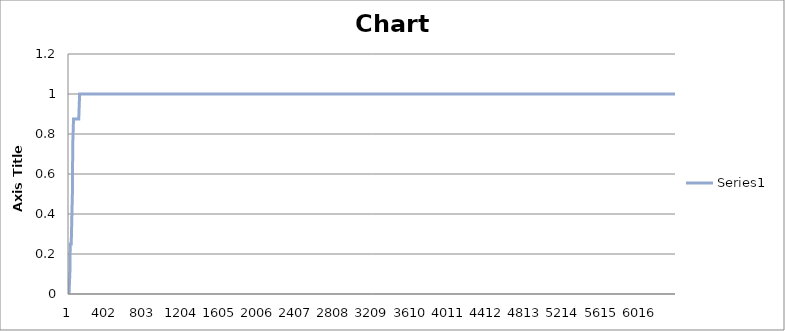
| Category | Series 1 |
|---|---|
| 0 | 0 |
| 1 | 0 |
| 2 | 0 |
| 3 | 0 |
| 4 | 0 |
| 5 | 0 |
| 6 | 0 |
| 7 | 0 |
| 8 | 0 |
| 9 | 0 |
| 10 | 0.125 |
| 11 | 0.125 |
| 12 | 0.25 |
| 13 | 0.25 |
| 14 | 0.25 |
| 15 | 0.25 |
| 16 | 0.25 |
| 17 | 0.25 |
| 18 | 0.25 |
| 19 | 0.25 |
| 20 | 0.25 |
| 21 | 0.25 |
| 22 | 0.25 |
| 23 | 0.25 |
| 24 | 0.25 |
| 25 | 0.25 |
| 26 | 0.25 |
| 27 | 0.25 |
| 28 | 0.25 |
| 29 | 0.375 |
| 30 | 0.375 |
| 31 | 0.375 |
| 32 | 0.375 |
| 33 | 0.375 |
| 34 | 0.375 |
| 35 | 0.5 |
| 36 | 0.5 |
| 37 | 0.625 |
| 38 | 0.625 |
| 39 | 0.75 |
| 40 | 0.75 |
| 41 | 0.75 |
| 42 | 0.75 |
| 43 | 0.75 |
| 44 | 0.75 |
| 45 | 0.75 |
| 46 | 0.75 |
| 47 | 0.875 |
| 48 | 0.875 |
| 49 | 0.875 |
| 50 | 0.875 |
| 51 | 0.875 |
| 52 | 0.875 |
| 53 | 0.875 |
| 54 | 0.875 |
| 55 | 0.875 |
| 56 | 0.875 |
| 57 | 0.875 |
| 58 | 0.875 |
| 59 | 0.875 |
| 60 | 0.875 |
| 61 | 0.875 |
| 62 | 0.875 |
| 63 | 0.875 |
| 64 | 0.875 |
| 65 | 0.875 |
| 66 | 0.875 |
| 67 | 0.875 |
| 68 | 0.875 |
| 69 | 0.875 |
| 70 | 0.875 |
| 71 | 0.875 |
| 72 | 0.875 |
| 73 | 0.875 |
| 74 | 0.875 |
| 75 | 0.875 |
| 76 | 0.875 |
| 77 | 0.875 |
| 78 | 0.875 |
| 79 | 0.875 |
| 80 | 0.875 |
| 81 | 0.875 |
| 82 | 0.875 |
| 83 | 0.875 |
| 84 | 0.875 |
| 85 | 0.875 |
| 86 | 0.875 |
| 87 | 0.875 |
| 88 | 0.875 |
| 89 | 0.875 |
| 90 | 0.875 |
| 91 | 0.875 |
| 92 | 0.875 |
| 93 | 0.875 |
| 94 | 0.875 |
| 95 | 0.875 |
| 96 | 0.875 |
| 97 | 0.875 |
| 98 | 0.875 |
| 99 | 0.875 |
| 100 | 0.875 |
| 101 | 0.875 |
| 102 | 0.875 |
| 103 | 0.875 |
| 104 | 0.875 |
| 105 | 0.875 |
| 106 | 0.875 |
| 107 | 0.875 |
| 108 | 0.875 |
| 109 | 0.875 |
| 110 | 0.875 |
| 111 | 1 |
| 112 | 1 |
| 113 | 1 |
| 114 | 1 |
| 115 | 1 |
| 116 | 1 |
| 117 | 1 |
| 118 | 1 |
| 119 | 1 |
| 120 | 1 |
| 121 | 1 |
| 122 | 1 |
| 123 | 1 |
| 124 | 1 |
| 125 | 1 |
| 126 | 1 |
| 127 | 1 |
| 128 | 1 |
| 129 | 1 |
| 130 | 1 |
| 131 | 1 |
| 132 | 1 |
| 133 | 1 |
| 134 | 1 |
| 135 | 1 |
| 136 | 1 |
| 137 | 1 |
| 138 | 1 |
| 139 | 1 |
| 140 | 1 |
| 141 | 1 |
| 142 | 1 |
| 143 | 1 |
| 144 | 1 |
| 145 | 1 |
| 146 | 1 |
| 147 | 1 |
| 148 | 1 |
| 149 | 1 |
| 150 | 1 |
| 151 | 1 |
| 152 | 1 |
| 153 | 1 |
| 154 | 1 |
| 155 | 1 |
| 156 | 1 |
| 157 | 1 |
| 158 | 1 |
| 159 | 1 |
| 160 | 1 |
| 161 | 1 |
| 162 | 1 |
| 163 | 1 |
| 164 | 1 |
| 165 | 1 |
| 166 | 1 |
| 167 | 1 |
| 168 | 1 |
| 169 | 1 |
| 170 | 1 |
| 171 | 1 |
| 172 | 1 |
| 173 | 1 |
| 174 | 1 |
| 175 | 1 |
| 176 | 1 |
| 177 | 1 |
| 178 | 1 |
| 179 | 1 |
| 180 | 1 |
| 181 | 1 |
| 182 | 1 |
| 183 | 1 |
| 184 | 1 |
| 185 | 1 |
| 186 | 1 |
| 187 | 1 |
| 188 | 1 |
| 189 | 1 |
| 190 | 1 |
| 191 | 1 |
| 192 | 1 |
| 193 | 1 |
| 194 | 1 |
| 195 | 1 |
| 196 | 1 |
| 197 | 1 |
| 198 | 1 |
| 199 | 1 |
| 200 | 1 |
| 201 | 1 |
| 202 | 1 |
| 203 | 1 |
| 204 | 1 |
| 205 | 1 |
| 206 | 1 |
| 207 | 1 |
| 208 | 1 |
| 209 | 1 |
| 210 | 1 |
| 211 | 1 |
| 212 | 1 |
| 213 | 1 |
| 214 | 1 |
| 215 | 1 |
| 216 | 1 |
| 217 | 1 |
| 218 | 1 |
| 219 | 1 |
| 220 | 1 |
| 221 | 1 |
| 222 | 1 |
| 223 | 1 |
| 224 | 1 |
| 225 | 1 |
| 226 | 1 |
| 227 | 1 |
| 228 | 1 |
| 229 | 1 |
| 230 | 1 |
| 231 | 1 |
| 232 | 1 |
| 233 | 1 |
| 234 | 1 |
| 235 | 1 |
| 236 | 1 |
| 237 | 1 |
| 238 | 1 |
| 239 | 1 |
| 240 | 1 |
| 241 | 1 |
| 242 | 1 |
| 243 | 1 |
| 244 | 1 |
| 245 | 1 |
| 246 | 1 |
| 247 | 1 |
| 248 | 1 |
| 249 | 1 |
| 250 | 1 |
| 251 | 1 |
| 252 | 1 |
| 253 | 1 |
| 254 | 1 |
| 255 | 1 |
| 256 | 1 |
| 257 | 1 |
| 258 | 1 |
| 259 | 1 |
| 260 | 1 |
| 261 | 1 |
| 262 | 1 |
| 263 | 1 |
| 264 | 1 |
| 265 | 1 |
| 266 | 1 |
| 267 | 1 |
| 268 | 1 |
| 269 | 1 |
| 270 | 1 |
| 271 | 1 |
| 272 | 1 |
| 273 | 1 |
| 274 | 1 |
| 275 | 1 |
| 276 | 1 |
| 277 | 1 |
| 278 | 1 |
| 279 | 1 |
| 280 | 1 |
| 281 | 1 |
| 282 | 1 |
| 283 | 1 |
| 284 | 1 |
| 285 | 1 |
| 286 | 1 |
| 287 | 1 |
| 288 | 1 |
| 289 | 1 |
| 290 | 1 |
| 291 | 1 |
| 292 | 1 |
| 293 | 1 |
| 294 | 1 |
| 295 | 1 |
| 296 | 1 |
| 297 | 1 |
| 298 | 1 |
| 299 | 1 |
| 300 | 1 |
| 301 | 1 |
| 302 | 1 |
| 303 | 1 |
| 304 | 1 |
| 305 | 1 |
| 306 | 1 |
| 307 | 1 |
| 308 | 1 |
| 309 | 1 |
| 310 | 1 |
| 311 | 1 |
| 312 | 1 |
| 313 | 1 |
| 314 | 1 |
| 315 | 1 |
| 316 | 1 |
| 317 | 1 |
| 318 | 1 |
| 319 | 1 |
| 320 | 1 |
| 321 | 1 |
| 322 | 1 |
| 323 | 1 |
| 324 | 1 |
| 325 | 1 |
| 326 | 1 |
| 327 | 1 |
| 328 | 1 |
| 329 | 1 |
| 330 | 1 |
| 331 | 1 |
| 332 | 1 |
| 333 | 1 |
| 334 | 1 |
| 335 | 1 |
| 336 | 1 |
| 337 | 1 |
| 338 | 1 |
| 339 | 1 |
| 340 | 1 |
| 341 | 1 |
| 342 | 1 |
| 343 | 1 |
| 344 | 1 |
| 345 | 1 |
| 346 | 1 |
| 347 | 1 |
| 348 | 1 |
| 349 | 1 |
| 350 | 1 |
| 351 | 1 |
| 352 | 1 |
| 353 | 1 |
| 354 | 1 |
| 355 | 1 |
| 356 | 1 |
| 357 | 1 |
| 358 | 1 |
| 359 | 1 |
| 360 | 1 |
| 361 | 1 |
| 362 | 1 |
| 363 | 1 |
| 364 | 1 |
| 365 | 1 |
| 366 | 1 |
| 367 | 1 |
| 368 | 1 |
| 369 | 1 |
| 370 | 1 |
| 371 | 1 |
| 372 | 1 |
| 373 | 1 |
| 374 | 1 |
| 375 | 1 |
| 376 | 1 |
| 377 | 1 |
| 378 | 1 |
| 379 | 1 |
| 380 | 1 |
| 381 | 1 |
| 382 | 1 |
| 383 | 1 |
| 384 | 1 |
| 385 | 1 |
| 386 | 1 |
| 387 | 1 |
| 388 | 1 |
| 389 | 1 |
| 390 | 1 |
| 391 | 1 |
| 392 | 1 |
| 393 | 1 |
| 394 | 1 |
| 395 | 1 |
| 396 | 1 |
| 397 | 1 |
| 398 | 1 |
| 399 | 1 |
| 400 | 1 |
| 401 | 1 |
| 402 | 1 |
| 403 | 1 |
| 404 | 1 |
| 405 | 1 |
| 406 | 1 |
| 407 | 1 |
| 408 | 1 |
| 409 | 1 |
| 410 | 1 |
| 411 | 1 |
| 412 | 1 |
| 413 | 1 |
| 414 | 1 |
| 415 | 1 |
| 416 | 1 |
| 417 | 1 |
| 418 | 1 |
| 419 | 1 |
| 420 | 1 |
| 421 | 1 |
| 422 | 1 |
| 423 | 1 |
| 424 | 1 |
| 425 | 1 |
| 426 | 1 |
| 427 | 1 |
| 428 | 1 |
| 429 | 1 |
| 430 | 1 |
| 431 | 1 |
| 432 | 1 |
| 433 | 1 |
| 434 | 1 |
| 435 | 1 |
| 436 | 1 |
| 437 | 1 |
| 438 | 1 |
| 439 | 1 |
| 440 | 1 |
| 441 | 1 |
| 442 | 1 |
| 443 | 1 |
| 444 | 1 |
| 445 | 1 |
| 446 | 1 |
| 447 | 1 |
| 448 | 1 |
| 449 | 1 |
| 450 | 1 |
| 451 | 1 |
| 452 | 1 |
| 453 | 1 |
| 454 | 1 |
| 455 | 1 |
| 456 | 1 |
| 457 | 1 |
| 458 | 1 |
| 459 | 1 |
| 460 | 1 |
| 461 | 1 |
| 462 | 1 |
| 463 | 1 |
| 464 | 1 |
| 465 | 1 |
| 466 | 1 |
| 467 | 1 |
| 468 | 1 |
| 469 | 1 |
| 470 | 1 |
| 471 | 1 |
| 472 | 1 |
| 473 | 1 |
| 474 | 1 |
| 475 | 1 |
| 476 | 1 |
| 477 | 1 |
| 478 | 1 |
| 479 | 1 |
| 480 | 1 |
| 481 | 1 |
| 482 | 1 |
| 483 | 1 |
| 484 | 1 |
| 485 | 1 |
| 486 | 1 |
| 487 | 1 |
| 488 | 1 |
| 489 | 1 |
| 490 | 1 |
| 491 | 1 |
| 492 | 1 |
| 493 | 1 |
| 494 | 1 |
| 495 | 1 |
| 496 | 1 |
| 497 | 1 |
| 498 | 1 |
| 499 | 1 |
| 500 | 1 |
| 501 | 1 |
| 502 | 1 |
| 503 | 1 |
| 504 | 1 |
| 505 | 1 |
| 506 | 1 |
| 507 | 1 |
| 508 | 1 |
| 509 | 1 |
| 510 | 1 |
| 511 | 1 |
| 512 | 1 |
| 513 | 1 |
| 514 | 1 |
| 515 | 1 |
| 516 | 1 |
| 517 | 1 |
| 518 | 1 |
| 519 | 1 |
| 520 | 1 |
| 521 | 1 |
| 522 | 1 |
| 523 | 1 |
| 524 | 1 |
| 525 | 1 |
| 526 | 1 |
| 527 | 1 |
| 528 | 1 |
| 529 | 1 |
| 530 | 1 |
| 531 | 1 |
| 532 | 1 |
| 533 | 1 |
| 534 | 1 |
| 535 | 1 |
| 536 | 1 |
| 537 | 1 |
| 538 | 1 |
| 539 | 1 |
| 540 | 1 |
| 541 | 1 |
| 542 | 1 |
| 543 | 1 |
| 544 | 1 |
| 545 | 1 |
| 546 | 1 |
| 547 | 1 |
| 548 | 1 |
| 549 | 1 |
| 550 | 1 |
| 551 | 1 |
| 552 | 1 |
| 553 | 1 |
| 554 | 1 |
| 555 | 1 |
| 556 | 1 |
| 557 | 1 |
| 558 | 1 |
| 559 | 1 |
| 560 | 1 |
| 561 | 1 |
| 562 | 1 |
| 563 | 1 |
| 564 | 1 |
| 565 | 1 |
| 566 | 1 |
| 567 | 1 |
| 568 | 1 |
| 569 | 1 |
| 570 | 1 |
| 571 | 1 |
| 572 | 1 |
| 573 | 1 |
| 574 | 1 |
| 575 | 1 |
| 576 | 1 |
| 577 | 1 |
| 578 | 1 |
| 579 | 1 |
| 580 | 1 |
| 581 | 1 |
| 582 | 1 |
| 583 | 1 |
| 584 | 1 |
| 585 | 1 |
| 586 | 1 |
| 587 | 1 |
| 588 | 1 |
| 589 | 1 |
| 590 | 1 |
| 591 | 1 |
| 592 | 1 |
| 593 | 1 |
| 594 | 1 |
| 595 | 1 |
| 596 | 1 |
| 597 | 1 |
| 598 | 1 |
| 599 | 1 |
| 600 | 1 |
| 601 | 1 |
| 602 | 1 |
| 603 | 1 |
| 604 | 1 |
| 605 | 1 |
| 606 | 1 |
| 607 | 1 |
| 608 | 1 |
| 609 | 1 |
| 610 | 1 |
| 611 | 1 |
| 612 | 1 |
| 613 | 1 |
| 614 | 1 |
| 615 | 1 |
| 616 | 1 |
| 617 | 1 |
| 618 | 1 |
| 619 | 1 |
| 620 | 1 |
| 621 | 1 |
| 622 | 1 |
| 623 | 1 |
| 624 | 1 |
| 625 | 1 |
| 626 | 1 |
| 627 | 1 |
| 628 | 1 |
| 629 | 1 |
| 630 | 1 |
| 631 | 1 |
| 632 | 1 |
| 633 | 1 |
| 634 | 1 |
| 635 | 1 |
| 636 | 1 |
| 637 | 1 |
| 638 | 1 |
| 639 | 1 |
| 640 | 1 |
| 641 | 1 |
| 642 | 1 |
| 643 | 1 |
| 644 | 1 |
| 645 | 1 |
| 646 | 1 |
| 647 | 1 |
| 648 | 1 |
| 649 | 1 |
| 650 | 1 |
| 651 | 1 |
| 652 | 1 |
| 653 | 1 |
| 654 | 1 |
| 655 | 1 |
| 656 | 1 |
| 657 | 1 |
| 658 | 1 |
| 659 | 1 |
| 660 | 1 |
| 661 | 1 |
| 662 | 1 |
| 663 | 1 |
| 664 | 1 |
| 665 | 1 |
| 666 | 1 |
| 667 | 1 |
| 668 | 1 |
| 669 | 1 |
| 670 | 1 |
| 671 | 1 |
| 672 | 1 |
| 673 | 1 |
| 674 | 1 |
| 675 | 1 |
| 676 | 1 |
| 677 | 1 |
| 678 | 1 |
| 679 | 1 |
| 680 | 1 |
| 681 | 1 |
| 682 | 1 |
| 683 | 1 |
| 684 | 1 |
| 685 | 1 |
| 686 | 1 |
| 687 | 1 |
| 688 | 1 |
| 689 | 1 |
| 690 | 1 |
| 691 | 1 |
| 692 | 1 |
| 693 | 1 |
| 694 | 1 |
| 695 | 1 |
| 696 | 1 |
| 697 | 1 |
| 698 | 1 |
| 699 | 1 |
| 700 | 1 |
| 701 | 1 |
| 702 | 1 |
| 703 | 1 |
| 704 | 1 |
| 705 | 1 |
| 706 | 1 |
| 707 | 1 |
| 708 | 1 |
| 709 | 1 |
| 710 | 1 |
| 711 | 1 |
| 712 | 1 |
| 713 | 1 |
| 714 | 1 |
| 715 | 1 |
| 716 | 1 |
| 717 | 1 |
| 718 | 1 |
| 719 | 1 |
| 720 | 1 |
| 721 | 1 |
| 722 | 1 |
| 723 | 1 |
| 724 | 1 |
| 725 | 1 |
| 726 | 1 |
| 727 | 1 |
| 728 | 1 |
| 729 | 1 |
| 730 | 1 |
| 731 | 1 |
| 732 | 1 |
| 733 | 1 |
| 734 | 1 |
| 735 | 1 |
| 736 | 1 |
| 737 | 1 |
| 738 | 1 |
| 739 | 1 |
| 740 | 1 |
| 741 | 1 |
| 742 | 1 |
| 743 | 1 |
| 744 | 1 |
| 745 | 1 |
| 746 | 1 |
| 747 | 1 |
| 748 | 1 |
| 749 | 1 |
| 750 | 1 |
| 751 | 1 |
| 752 | 1 |
| 753 | 1 |
| 754 | 1 |
| 755 | 1 |
| 756 | 1 |
| 757 | 1 |
| 758 | 1 |
| 759 | 1 |
| 760 | 1 |
| 761 | 1 |
| 762 | 1 |
| 763 | 1 |
| 764 | 1 |
| 765 | 1 |
| 766 | 1 |
| 767 | 1 |
| 768 | 1 |
| 769 | 1 |
| 770 | 1 |
| 771 | 1 |
| 772 | 1 |
| 773 | 1 |
| 774 | 1 |
| 775 | 1 |
| 776 | 1 |
| 777 | 1 |
| 778 | 1 |
| 779 | 1 |
| 780 | 1 |
| 781 | 1 |
| 782 | 1 |
| 783 | 1 |
| 784 | 1 |
| 785 | 1 |
| 786 | 1 |
| 787 | 1 |
| 788 | 1 |
| 789 | 1 |
| 790 | 1 |
| 791 | 1 |
| 792 | 1 |
| 793 | 1 |
| 794 | 1 |
| 795 | 1 |
| 796 | 1 |
| 797 | 1 |
| 798 | 1 |
| 799 | 1 |
| 800 | 1 |
| 801 | 1 |
| 802 | 1 |
| 803 | 1 |
| 804 | 1 |
| 805 | 1 |
| 806 | 1 |
| 807 | 1 |
| 808 | 1 |
| 809 | 1 |
| 810 | 1 |
| 811 | 1 |
| 812 | 1 |
| 813 | 1 |
| 814 | 1 |
| 815 | 1 |
| 816 | 1 |
| 817 | 1 |
| 818 | 1 |
| 819 | 1 |
| 820 | 1 |
| 821 | 1 |
| 822 | 1 |
| 823 | 1 |
| 824 | 1 |
| 825 | 1 |
| 826 | 1 |
| 827 | 1 |
| 828 | 1 |
| 829 | 1 |
| 830 | 1 |
| 831 | 1 |
| 832 | 1 |
| 833 | 1 |
| 834 | 1 |
| 835 | 1 |
| 836 | 1 |
| 837 | 1 |
| 838 | 1 |
| 839 | 1 |
| 840 | 1 |
| 841 | 1 |
| 842 | 1 |
| 843 | 1 |
| 844 | 1 |
| 845 | 1 |
| 846 | 1 |
| 847 | 1 |
| 848 | 1 |
| 849 | 1 |
| 850 | 1 |
| 851 | 1 |
| 852 | 1 |
| 853 | 1 |
| 854 | 1 |
| 855 | 1 |
| 856 | 1 |
| 857 | 1 |
| 858 | 1 |
| 859 | 1 |
| 860 | 1 |
| 861 | 1 |
| 862 | 1 |
| 863 | 1 |
| 864 | 1 |
| 865 | 1 |
| 866 | 1 |
| 867 | 1 |
| 868 | 1 |
| 869 | 1 |
| 870 | 1 |
| 871 | 1 |
| 872 | 1 |
| 873 | 1 |
| 874 | 1 |
| 875 | 1 |
| 876 | 1 |
| 877 | 1 |
| 878 | 1 |
| 879 | 1 |
| 880 | 1 |
| 881 | 1 |
| 882 | 1 |
| 883 | 1 |
| 884 | 1 |
| 885 | 1 |
| 886 | 1 |
| 887 | 1 |
| 888 | 1 |
| 889 | 1 |
| 890 | 1 |
| 891 | 1 |
| 892 | 1 |
| 893 | 1 |
| 894 | 1 |
| 895 | 1 |
| 896 | 1 |
| 897 | 1 |
| 898 | 1 |
| 899 | 1 |
| 900 | 1 |
| 901 | 1 |
| 902 | 1 |
| 903 | 1 |
| 904 | 1 |
| 905 | 1 |
| 906 | 1 |
| 907 | 1 |
| 908 | 1 |
| 909 | 1 |
| 910 | 1 |
| 911 | 1 |
| 912 | 1 |
| 913 | 1 |
| 914 | 1 |
| 915 | 1 |
| 916 | 1 |
| 917 | 1 |
| 918 | 1 |
| 919 | 1 |
| 920 | 1 |
| 921 | 1 |
| 922 | 1 |
| 923 | 1 |
| 924 | 1 |
| 925 | 1 |
| 926 | 1 |
| 927 | 1 |
| 928 | 1 |
| 929 | 1 |
| 930 | 1 |
| 931 | 1 |
| 932 | 1 |
| 933 | 1 |
| 934 | 1 |
| 935 | 1 |
| 936 | 1 |
| 937 | 1 |
| 938 | 1 |
| 939 | 1 |
| 940 | 1 |
| 941 | 1 |
| 942 | 1 |
| 943 | 1 |
| 944 | 1 |
| 945 | 1 |
| 946 | 1 |
| 947 | 1 |
| 948 | 1 |
| 949 | 1 |
| 950 | 1 |
| 951 | 1 |
| 952 | 1 |
| 953 | 1 |
| 954 | 1 |
| 955 | 1 |
| 956 | 1 |
| 957 | 1 |
| 958 | 1 |
| 959 | 1 |
| 960 | 1 |
| 961 | 1 |
| 962 | 1 |
| 963 | 1 |
| 964 | 1 |
| 965 | 1 |
| 966 | 1 |
| 967 | 1 |
| 968 | 1 |
| 969 | 1 |
| 970 | 1 |
| 971 | 1 |
| 972 | 1 |
| 973 | 1 |
| 974 | 1 |
| 975 | 1 |
| 976 | 1 |
| 977 | 1 |
| 978 | 1 |
| 979 | 1 |
| 980 | 1 |
| 981 | 1 |
| 982 | 1 |
| 983 | 1 |
| 984 | 1 |
| 985 | 1 |
| 986 | 1 |
| 987 | 1 |
| 988 | 1 |
| 989 | 1 |
| 990 | 1 |
| 991 | 1 |
| 992 | 1 |
| 993 | 1 |
| 994 | 1 |
| 995 | 1 |
| 996 | 1 |
| 997 | 1 |
| 998 | 1 |
| 999 | 1 |
| 1000 | 1 |
| 1001 | 1 |
| 1002 | 1 |
| 1003 | 1 |
| 1004 | 1 |
| 1005 | 1 |
| 1006 | 1 |
| 1007 | 1 |
| 1008 | 1 |
| 1009 | 1 |
| 1010 | 1 |
| 1011 | 1 |
| 1012 | 1 |
| 1013 | 1 |
| 1014 | 1 |
| 1015 | 1 |
| 1016 | 1 |
| 1017 | 1 |
| 1018 | 1 |
| 1019 | 1 |
| 1020 | 1 |
| 1021 | 1 |
| 1022 | 1 |
| 1023 | 1 |
| 1024 | 1 |
| 1025 | 1 |
| 1026 | 1 |
| 1027 | 1 |
| 1028 | 1 |
| 1029 | 1 |
| 1030 | 1 |
| 1031 | 1 |
| 1032 | 1 |
| 1033 | 1 |
| 1034 | 1 |
| 1035 | 1 |
| 1036 | 1 |
| 1037 | 1 |
| 1038 | 1 |
| 1039 | 1 |
| 1040 | 1 |
| 1041 | 1 |
| 1042 | 1 |
| 1043 | 1 |
| 1044 | 1 |
| 1045 | 1 |
| 1046 | 1 |
| 1047 | 1 |
| 1048 | 1 |
| 1049 | 1 |
| 1050 | 1 |
| 1051 | 1 |
| 1052 | 1 |
| 1053 | 1 |
| 1054 | 1 |
| 1055 | 1 |
| 1056 | 1 |
| 1057 | 1 |
| 1058 | 1 |
| 1059 | 1 |
| 1060 | 1 |
| 1061 | 1 |
| 1062 | 1 |
| 1063 | 1 |
| 1064 | 1 |
| 1065 | 1 |
| 1066 | 1 |
| 1067 | 1 |
| 1068 | 1 |
| 1069 | 1 |
| 1070 | 1 |
| 1071 | 1 |
| 1072 | 1 |
| 1073 | 1 |
| 1074 | 1 |
| 1075 | 1 |
| 1076 | 1 |
| 1077 | 1 |
| 1078 | 1 |
| 1079 | 1 |
| 1080 | 1 |
| 1081 | 1 |
| 1082 | 1 |
| 1083 | 1 |
| 1084 | 1 |
| 1085 | 1 |
| 1086 | 1 |
| 1087 | 1 |
| 1088 | 1 |
| 1089 | 1 |
| 1090 | 1 |
| 1091 | 1 |
| 1092 | 1 |
| 1093 | 1 |
| 1094 | 1 |
| 1095 | 1 |
| 1096 | 1 |
| 1097 | 1 |
| 1098 | 1 |
| 1099 | 1 |
| 1100 | 1 |
| 1101 | 1 |
| 1102 | 1 |
| 1103 | 1 |
| 1104 | 1 |
| 1105 | 1 |
| 1106 | 1 |
| 1107 | 1 |
| 1108 | 1 |
| 1109 | 1 |
| 1110 | 1 |
| 1111 | 1 |
| 1112 | 1 |
| 1113 | 1 |
| 1114 | 1 |
| 1115 | 1 |
| 1116 | 1 |
| 1117 | 1 |
| 1118 | 1 |
| 1119 | 1 |
| 1120 | 1 |
| 1121 | 1 |
| 1122 | 1 |
| 1123 | 1 |
| 1124 | 1 |
| 1125 | 1 |
| 1126 | 1 |
| 1127 | 1 |
| 1128 | 1 |
| 1129 | 1 |
| 1130 | 1 |
| 1131 | 1 |
| 1132 | 1 |
| 1133 | 1 |
| 1134 | 1 |
| 1135 | 1 |
| 1136 | 1 |
| 1137 | 1 |
| 1138 | 1 |
| 1139 | 1 |
| 1140 | 1 |
| 1141 | 1 |
| 1142 | 1 |
| 1143 | 1 |
| 1144 | 1 |
| 1145 | 1 |
| 1146 | 1 |
| 1147 | 1 |
| 1148 | 1 |
| 1149 | 1 |
| 1150 | 1 |
| 1151 | 1 |
| 1152 | 1 |
| 1153 | 1 |
| 1154 | 1 |
| 1155 | 1 |
| 1156 | 1 |
| 1157 | 1 |
| 1158 | 1 |
| 1159 | 1 |
| 1160 | 1 |
| 1161 | 1 |
| 1162 | 1 |
| 1163 | 1 |
| 1164 | 1 |
| 1165 | 1 |
| 1166 | 1 |
| 1167 | 1 |
| 1168 | 1 |
| 1169 | 1 |
| 1170 | 1 |
| 1171 | 1 |
| 1172 | 1 |
| 1173 | 1 |
| 1174 | 1 |
| 1175 | 1 |
| 1176 | 1 |
| 1177 | 1 |
| 1178 | 1 |
| 1179 | 1 |
| 1180 | 1 |
| 1181 | 1 |
| 1182 | 1 |
| 1183 | 1 |
| 1184 | 1 |
| 1185 | 1 |
| 1186 | 1 |
| 1187 | 1 |
| 1188 | 1 |
| 1189 | 1 |
| 1190 | 1 |
| 1191 | 1 |
| 1192 | 1 |
| 1193 | 1 |
| 1194 | 1 |
| 1195 | 1 |
| 1196 | 1 |
| 1197 | 1 |
| 1198 | 1 |
| 1199 | 1 |
| 1200 | 1 |
| 1201 | 1 |
| 1202 | 1 |
| 1203 | 1 |
| 1204 | 1 |
| 1205 | 1 |
| 1206 | 1 |
| 1207 | 1 |
| 1208 | 1 |
| 1209 | 1 |
| 1210 | 1 |
| 1211 | 1 |
| 1212 | 1 |
| 1213 | 1 |
| 1214 | 1 |
| 1215 | 1 |
| 1216 | 1 |
| 1217 | 1 |
| 1218 | 1 |
| 1219 | 1 |
| 1220 | 1 |
| 1221 | 1 |
| 1222 | 1 |
| 1223 | 1 |
| 1224 | 1 |
| 1225 | 1 |
| 1226 | 1 |
| 1227 | 1 |
| 1228 | 1 |
| 1229 | 1 |
| 1230 | 1 |
| 1231 | 1 |
| 1232 | 1 |
| 1233 | 1 |
| 1234 | 1 |
| 1235 | 1 |
| 1236 | 1 |
| 1237 | 1 |
| 1238 | 1 |
| 1239 | 1 |
| 1240 | 1 |
| 1241 | 1 |
| 1242 | 1 |
| 1243 | 1 |
| 1244 | 1 |
| 1245 | 1 |
| 1246 | 1 |
| 1247 | 1 |
| 1248 | 1 |
| 1249 | 1 |
| 1250 | 1 |
| 1251 | 1 |
| 1252 | 1 |
| 1253 | 1 |
| 1254 | 1 |
| 1255 | 1 |
| 1256 | 1 |
| 1257 | 1 |
| 1258 | 1 |
| 1259 | 1 |
| 1260 | 1 |
| 1261 | 1 |
| 1262 | 1 |
| 1263 | 1 |
| 1264 | 1 |
| 1265 | 1 |
| 1266 | 1 |
| 1267 | 1 |
| 1268 | 1 |
| 1269 | 1 |
| 1270 | 1 |
| 1271 | 1 |
| 1272 | 1 |
| 1273 | 1 |
| 1274 | 1 |
| 1275 | 1 |
| 1276 | 1 |
| 1277 | 1 |
| 1278 | 1 |
| 1279 | 1 |
| 1280 | 1 |
| 1281 | 1 |
| 1282 | 1 |
| 1283 | 1 |
| 1284 | 1 |
| 1285 | 1 |
| 1286 | 1 |
| 1287 | 1 |
| 1288 | 1 |
| 1289 | 1 |
| 1290 | 1 |
| 1291 | 1 |
| 1292 | 1 |
| 1293 | 1 |
| 1294 | 1 |
| 1295 | 1 |
| 1296 | 1 |
| 1297 | 1 |
| 1298 | 1 |
| 1299 | 1 |
| 1300 | 1 |
| 1301 | 1 |
| 1302 | 1 |
| 1303 | 1 |
| 1304 | 1 |
| 1305 | 1 |
| 1306 | 1 |
| 1307 | 1 |
| 1308 | 1 |
| 1309 | 1 |
| 1310 | 1 |
| 1311 | 1 |
| 1312 | 1 |
| 1313 | 1 |
| 1314 | 1 |
| 1315 | 1 |
| 1316 | 1 |
| 1317 | 1 |
| 1318 | 1 |
| 1319 | 1 |
| 1320 | 1 |
| 1321 | 1 |
| 1322 | 1 |
| 1323 | 1 |
| 1324 | 1 |
| 1325 | 1 |
| 1326 | 1 |
| 1327 | 1 |
| 1328 | 1 |
| 1329 | 1 |
| 1330 | 1 |
| 1331 | 1 |
| 1332 | 1 |
| 1333 | 1 |
| 1334 | 1 |
| 1335 | 1 |
| 1336 | 1 |
| 1337 | 1 |
| 1338 | 1 |
| 1339 | 1 |
| 1340 | 1 |
| 1341 | 1 |
| 1342 | 1 |
| 1343 | 1 |
| 1344 | 1 |
| 1345 | 1 |
| 1346 | 1 |
| 1347 | 1 |
| 1348 | 1 |
| 1349 | 1 |
| 1350 | 1 |
| 1351 | 1 |
| 1352 | 1 |
| 1353 | 1 |
| 1354 | 1 |
| 1355 | 1 |
| 1356 | 1 |
| 1357 | 1 |
| 1358 | 1 |
| 1359 | 1 |
| 1360 | 1 |
| 1361 | 1 |
| 1362 | 1 |
| 1363 | 1 |
| 1364 | 1 |
| 1365 | 1 |
| 1366 | 1 |
| 1367 | 1 |
| 1368 | 1 |
| 1369 | 1 |
| 1370 | 1 |
| 1371 | 1 |
| 1372 | 1 |
| 1373 | 1 |
| 1374 | 1 |
| 1375 | 1 |
| 1376 | 1 |
| 1377 | 1 |
| 1378 | 1 |
| 1379 | 1 |
| 1380 | 1 |
| 1381 | 1 |
| 1382 | 1 |
| 1383 | 1 |
| 1384 | 1 |
| 1385 | 1 |
| 1386 | 1 |
| 1387 | 1 |
| 1388 | 1 |
| 1389 | 1 |
| 1390 | 1 |
| 1391 | 1 |
| 1392 | 1 |
| 1393 | 1 |
| 1394 | 1 |
| 1395 | 1 |
| 1396 | 1 |
| 1397 | 1 |
| 1398 | 1 |
| 1399 | 1 |
| 1400 | 1 |
| 1401 | 1 |
| 1402 | 1 |
| 1403 | 1 |
| 1404 | 1 |
| 1405 | 1 |
| 1406 | 1 |
| 1407 | 1 |
| 1408 | 1 |
| 1409 | 1 |
| 1410 | 1 |
| 1411 | 1 |
| 1412 | 1 |
| 1413 | 1 |
| 1414 | 1 |
| 1415 | 1 |
| 1416 | 1 |
| 1417 | 1 |
| 1418 | 1 |
| 1419 | 1 |
| 1420 | 1 |
| 1421 | 1 |
| 1422 | 1 |
| 1423 | 1 |
| 1424 | 1 |
| 1425 | 1 |
| 1426 | 1 |
| 1427 | 1 |
| 1428 | 1 |
| 1429 | 1 |
| 1430 | 1 |
| 1431 | 1 |
| 1432 | 1 |
| 1433 | 1 |
| 1434 | 1 |
| 1435 | 1 |
| 1436 | 1 |
| 1437 | 1 |
| 1438 | 1 |
| 1439 | 1 |
| 1440 | 1 |
| 1441 | 1 |
| 1442 | 1 |
| 1443 | 1 |
| 1444 | 1 |
| 1445 | 1 |
| 1446 | 1 |
| 1447 | 1 |
| 1448 | 1 |
| 1449 | 1 |
| 1450 | 1 |
| 1451 | 1 |
| 1452 | 1 |
| 1453 | 1 |
| 1454 | 1 |
| 1455 | 1 |
| 1456 | 1 |
| 1457 | 1 |
| 1458 | 1 |
| 1459 | 1 |
| 1460 | 1 |
| 1461 | 1 |
| 1462 | 1 |
| 1463 | 1 |
| 1464 | 1 |
| 1465 | 1 |
| 1466 | 1 |
| 1467 | 1 |
| 1468 | 1 |
| 1469 | 1 |
| 1470 | 1 |
| 1471 | 1 |
| 1472 | 1 |
| 1473 | 1 |
| 1474 | 1 |
| 1475 | 1 |
| 1476 | 1 |
| 1477 | 1 |
| 1478 | 1 |
| 1479 | 1 |
| 1480 | 1 |
| 1481 | 1 |
| 1482 | 1 |
| 1483 | 1 |
| 1484 | 1 |
| 1485 | 1 |
| 1486 | 1 |
| 1487 | 1 |
| 1488 | 1 |
| 1489 | 1 |
| 1490 | 1 |
| 1491 | 1 |
| 1492 | 1 |
| 1493 | 1 |
| 1494 | 1 |
| 1495 | 1 |
| 1496 | 1 |
| 1497 | 1 |
| 1498 | 1 |
| 1499 | 1 |
| 1500 | 1 |
| 1501 | 1 |
| 1502 | 1 |
| 1503 | 1 |
| 1504 | 1 |
| 1505 | 1 |
| 1506 | 1 |
| 1507 | 1 |
| 1508 | 1 |
| 1509 | 1 |
| 1510 | 1 |
| 1511 | 1 |
| 1512 | 1 |
| 1513 | 1 |
| 1514 | 1 |
| 1515 | 1 |
| 1516 | 1 |
| 1517 | 1 |
| 1518 | 1 |
| 1519 | 1 |
| 1520 | 1 |
| 1521 | 1 |
| 1522 | 1 |
| 1523 | 1 |
| 1524 | 1 |
| 1525 | 1 |
| 1526 | 1 |
| 1527 | 1 |
| 1528 | 1 |
| 1529 | 1 |
| 1530 | 1 |
| 1531 | 1 |
| 1532 | 1 |
| 1533 | 1 |
| 1534 | 1 |
| 1535 | 1 |
| 1536 | 1 |
| 1537 | 1 |
| 1538 | 1 |
| 1539 | 1 |
| 1540 | 1 |
| 1541 | 1 |
| 1542 | 1 |
| 1543 | 1 |
| 1544 | 1 |
| 1545 | 1 |
| 1546 | 1 |
| 1547 | 1 |
| 1548 | 1 |
| 1549 | 1 |
| 1550 | 1 |
| 1551 | 1 |
| 1552 | 1 |
| 1553 | 1 |
| 1554 | 1 |
| 1555 | 1 |
| 1556 | 1 |
| 1557 | 1 |
| 1558 | 1 |
| 1559 | 1 |
| 1560 | 1 |
| 1561 | 1 |
| 1562 | 1 |
| 1563 | 1 |
| 1564 | 1 |
| 1565 | 1 |
| 1566 | 1 |
| 1567 | 1 |
| 1568 | 1 |
| 1569 | 1 |
| 1570 | 1 |
| 1571 | 1 |
| 1572 | 1 |
| 1573 | 1 |
| 1574 | 1 |
| 1575 | 1 |
| 1576 | 1 |
| 1577 | 1 |
| 1578 | 1 |
| 1579 | 1 |
| 1580 | 1 |
| 1581 | 1 |
| 1582 | 1 |
| 1583 | 1 |
| 1584 | 1 |
| 1585 | 1 |
| 1586 | 1 |
| 1587 | 1 |
| 1588 | 1 |
| 1589 | 1 |
| 1590 | 1 |
| 1591 | 1 |
| 1592 | 1 |
| 1593 | 1 |
| 1594 | 1 |
| 1595 | 1 |
| 1596 | 1 |
| 1597 | 1 |
| 1598 | 1 |
| 1599 | 1 |
| 1600 | 1 |
| 1601 | 1 |
| 1602 | 1 |
| 1603 | 1 |
| 1604 | 1 |
| 1605 | 1 |
| 1606 | 1 |
| 1607 | 1 |
| 1608 | 1 |
| 1609 | 1 |
| 1610 | 1 |
| 1611 | 1 |
| 1612 | 1 |
| 1613 | 1 |
| 1614 | 1 |
| 1615 | 1 |
| 1616 | 1 |
| 1617 | 1 |
| 1618 | 1 |
| 1619 | 1 |
| 1620 | 1 |
| 1621 | 1 |
| 1622 | 1 |
| 1623 | 1 |
| 1624 | 1 |
| 1625 | 1 |
| 1626 | 1 |
| 1627 | 1 |
| 1628 | 1 |
| 1629 | 1 |
| 1630 | 1 |
| 1631 | 1 |
| 1632 | 1 |
| 1633 | 1 |
| 1634 | 1 |
| 1635 | 1 |
| 1636 | 1 |
| 1637 | 1 |
| 1638 | 1 |
| 1639 | 1 |
| 1640 | 1 |
| 1641 | 1 |
| 1642 | 1 |
| 1643 | 1 |
| 1644 | 1 |
| 1645 | 1 |
| 1646 | 1 |
| 1647 | 1 |
| 1648 | 1 |
| 1649 | 1 |
| 1650 | 1 |
| 1651 | 1 |
| 1652 | 1 |
| 1653 | 1 |
| 1654 | 1 |
| 1655 | 1 |
| 1656 | 1 |
| 1657 | 1 |
| 1658 | 1 |
| 1659 | 1 |
| 1660 | 1 |
| 1661 | 1 |
| 1662 | 1 |
| 1663 | 1 |
| 1664 | 1 |
| 1665 | 1 |
| 1666 | 1 |
| 1667 | 1 |
| 1668 | 1 |
| 1669 | 1 |
| 1670 | 1 |
| 1671 | 1 |
| 1672 | 1 |
| 1673 | 1 |
| 1674 | 1 |
| 1675 | 1 |
| 1676 | 1 |
| 1677 | 1 |
| 1678 | 1 |
| 1679 | 1 |
| 1680 | 1 |
| 1681 | 1 |
| 1682 | 1 |
| 1683 | 1 |
| 1684 | 1 |
| 1685 | 1 |
| 1686 | 1 |
| 1687 | 1 |
| 1688 | 1 |
| 1689 | 1 |
| 1690 | 1 |
| 1691 | 1 |
| 1692 | 1 |
| 1693 | 1 |
| 1694 | 1 |
| 1695 | 1 |
| 1696 | 1 |
| 1697 | 1 |
| 1698 | 1 |
| 1699 | 1 |
| 1700 | 1 |
| 1701 | 1 |
| 1702 | 1 |
| 1703 | 1 |
| 1704 | 1 |
| 1705 | 1 |
| 1706 | 1 |
| 1707 | 1 |
| 1708 | 1 |
| 1709 | 1 |
| 1710 | 1 |
| 1711 | 1 |
| 1712 | 1 |
| 1713 | 1 |
| 1714 | 1 |
| 1715 | 1 |
| 1716 | 1 |
| 1717 | 1 |
| 1718 | 1 |
| 1719 | 1 |
| 1720 | 1 |
| 1721 | 1 |
| 1722 | 1 |
| 1723 | 1 |
| 1724 | 1 |
| 1725 | 1 |
| 1726 | 1 |
| 1727 | 1 |
| 1728 | 1 |
| 1729 | 1 |
| 1730 | 1 |
| 1731 | 1 |
| 1732 | 1 |
| 1733 | 1 |
| 1734 | 1 |
| 1735 | 1 |
| 1736 | 1 |
| 1737 | 1 |
| 1738 | 1 |
| 1739 | 1 |
| 1740 | 1 |
| 1741 | 1 |
| 1742 | 1 |
| 1743 | 1 |
| 1744 | 1 |
| 1745 | 1 |
| 1746 | 1 |
| 1747 | 1 |
| 1748 | 1 |
| 1749 | 1 |
| 1750 | 1 |
| 1751 | 1 |
| 1752 | 1 |
| 1753 | 1 |
| 1754 | 1 |
| 1755 | 1 |
| 1756 | 1 |
| 1757 | 1 |
| 1758 | 1 |
| 1759 | 1 |
| 1760 | 1 |
| 1761 | 1 |
| 1762 | 1 |
| 1763 | 1 |
| 1764 | 1 |
| 1765 | 1 |
| 1766 | 1 |
| 1767 | 1 |
| 1768 | 1 |
| 1769 | 1 |
| 1770 | 1 |
| 1771 | 1 |
| 1772 | 1 |
| 1773 | 1 |
| 1774 | 1 |
| 1775 | 1 |
| 1776 | 1 |
| 1777 | 1 |
| 1778 | 1 |
| 1779 | 1 |
| 1780 | 1 |
| 1781 | 1 |
| 1782 | 1 |
| 1783 | 1 |
| 1784 | 1 |
| 1785 | 1 |
| 1786 | 1 |
| 1787 | 1 |
| 1788 | 1 |
| 1789 | 1 |
| 1790 | 1 |
| 1791 | 1 |
| 1792 | 1 |
| 1793 | 1 |
| 1794 | 1 |
| 1795 | 1 |
| 1796 | 1 |
| 1797 | 1 |
| 1798 | 1 |
| 1799 | 1 |
| 1800 | 1 |
| 1801 | 1 |
| 1802 | 1 |
| 1803 | 1 |
| 1804 | 1 |
| 1805 | 1 |
| 1806 | 1 |
| 1807 | 1 |
| 1808 | 1 |
| 1809 | 1 |
| 1810 | 1 |
| 1811 | 1 |
| 1812 | 1 |
| 1813 | 1 |
| 1814 | 1 |
| 1815 | 1 |
| 1816 | 1 |
| 1817 | 1 |
| 1818 | 1 |
| 1819 | 1 |
| 1820 | 1 |
| 1821 | 1 |
| 1822 | 1 |
| 1823 | 1 |
| 1824 | 1 |
| 1825 | 1 |
| 1826 | 1 |
| 1827 | 1 |
| 1828 | 1 |
| 1829 | 1 |
| 1830 | 1 |
| 1831 | 1 |
| 1832 | 1 |
| 1833 | 1 |
| 1834 | 1 |
| 1835 | 1 |
| 1836 | 1 |
| 1837 | 1 |
| 1838 | 1 |
| 1839 | 1 |
| 1840 | 1 |
| 1841 | 1 |
| 1842 | 1 |
| 1843 | 1 |
| 1844 | 1 |
| 1845 | 1 |
| 1846 | 1 |
| 1847 | 1 |
| 1848 | 1 |
| 1849 | 1 |
| 1850 | 1 |
| 1851 | 1 |
| 1852 | 1 |
| 1853 | 1 |
| 1854 | 1 |
| 1855 | 1 |
| 1856 | 1 |
| 1857 | 1 |
| 1858 | 1 |
| 1859 | 1 |
| 1860 | 1 |
| 1861 | 1 |
| 1862 | 1 |
| 1863 | 1 |
| 1864 | 1 |
| 1865 | 1 |
| 1866 | 1 |
| 1867 | 1 |
| 1868 | 1 |
| 1869 | 1 |
| 1870 | 1 |
| 1871 | 1 |
| 1872 | 1 |
| 1873 | 1 |
| 1874 | 1 |
| 1875 | 1 |
| 1876 | 1 |
| 1877 | 1 |
| 1878 | 1 |
| 1879 | 1 |
| 1880 | 1 |
| 1881 | 1 |
| 1882 | 1 |
| 1883 | 1 |
| 1884 | 1 |
| 1885 | 1 |
| 1886 | 1 |
| 1887 | 1 |
| 1888 | 1 |
| 1889 | 1 |
| 1890 | 1 |
| 1891 | 1 |
| 1892 | 1 |
| 1893 | 1 |
| 1894 | 1 |
| 1895 | 1 |
| 1896 | 1 |
| 1897 | 1 |
| 1898 | 1 |
| 1899 | 1 |
| 1900 | 1 |
| 1901 | 1 |
| 1902 | 1 |
| 1903 | 1 |
| 1904 | 1 |
| 1905 | 1 |
| 1906 | 1 |
| 1907 | 1 |
| 1908 | 1 |
| 1909 | 1 |
| 1910 | 1 |
| 1911 | 1 |
| 1912 | 1 |
| 1913 | 1 |
| 1914 | 1 |
| 1915 | 1 |
| 1916 | 1 |
| 1917 | 1 |
| 1918 | 1 |
| 1919 | 1 |
| 1920 | 1 |
| 1921 | 1 |
| 1922 | 1 |
| 1923 | 1 |
| 1924 | 1 |
| 1925 | 1 |
| 1926 | 1 |
| 1927 | 1 |
| 1928 | 1 |
| 1929 | 1 |
| 1930 | 1 |
| 1931 | 1 |
| 1932 | 1 |
| 1933 | 1 |
| 1934 | 1 |
| 1935 | 1 |
| 1936 | 1 |
| 1937 | 1 |
| 1938 | 1 |
| 1939 | 1 |
| 1940 | 1 |
| 1941 | 1 |
| 1942 | 1 |
| 1943 | 1 |
| 1944 | 1 |
| 1945 | 1 |
| 1946 | 1 |
| 1947 | 1 |
| 1948 | 1 |
| 1949 | 1 |
| 1950 | 1 |
| 1951 | 1 |
| 1952 | 1 |
| 1953 | 1 |
| 1954 | 1 |
| 1955 | 1 |
| 1956 | 1 |
| 1957 | 1 |
| 1958 | 1 |
| 1959 | 1 |
| 1960 | 1 |
| 1961 | 1 |
| 1962 | 1 |
| 1963 | 1 |
| 1964 | 1 |
| 1965 | 1 |
| 1966 | 1 |
| 1967 | 1 |
| 1968 | 1 |
| 1969 | 1 |
| 1970 | 1 |
| 1971 | 1 |
| 1972 | 1 |
| 1973 | 1 |
| 1974 | 1 |
| 1975 | 1 |
| 1976 | 1 |
| 1977 | 1 |
| 1978 | 1 |
| 1979 | 1 |
| 1980 | 1 |
| 1981 | 1 |
| 1982 | 1 |
| 1983 | 1 |
| 1984 | 1 |
| 1985 | 1 |
| 1986 | 1 |
| 1987 | 1 |
| 1988 | 1 |
| 1989 | 1 |
| 1990 | 1 |
| 1991 | 1 |
| 1992 | 1 |
| 1993 | 1 |
| 1994 | 1 |
| 1995 | 1 |
| 1996 | 1 |
| 1997 | 1 |
| 1998 | 1 |
| 1999 | 1 |
| 2000 | 1 |
| 2001 | 1 |
| 2002 | 1 |
| 2003 | 1 |
| 2004 | 1 |
| 2005 | 1 |
| 2006 | 1 |
| 2007 | 1 |
| 2008 | 1 |
| 2009 | 1 |
| 2010 | 1 |
| 2011 | 1 |
| 2012 | 1 |
| 2013 | 1 |
| 2014 | 1 |
| 2015 | 1 |
| 2016 | 1 |
| 2017 | 1 |
| 2018 | 1 |
| 2019 | 1 |
| 2020 | 1 |
| 2021 | 1 |
| 2022 | 1 |
| 2023 | 1 |
| 2024 | 1 |
| 2025 | 1 |
| 2026 | 1 |
| 2027 | 1 |
| 2028 | 1 |
| 2029 | 1 |
| 2030 | 1 |
| 2031 | 1 |
| 2032 | 1 |
| 2033 | 1 |
| 2034 | 1 |
| 2035 | 1 |
| 2036 | 1 |
| 2037 | 1 |
| 2038 | 1 |
| 2039 | 1 |
| 2040 | 1 |
| 2041 | 1 |
| 2042 | 1 |
| 2043 | 1 |
| 2044 | 1 |
| 2045 | 1 |
| 2046 | 1 |
| 2047 | 1 |
| 2048 | 1 |
| 2049 | 1 |
| 2050 | 1 |
| 2051 | 1 |
| 2052 | 1 |
| 2053 | 1 |
| 2054 | 1 |
| 2055 | 1 |
| 2056 | 1 |
| 2057 | 1 |
| 2058 | 1 |
| 2059 | 1 |
| 2060 | 1 |
| 2061 | 1 |
| 2062 | 1 |
| 2063 | 1 |
| 2064 | 1 |
| 2065 | 1 |
| 2066 | 1 |
| 2067 | 1 |
| 2068 | 1 |
| 2069 | 1 |
| 2070 | 1 |
| 2071 | 1 |
| 2072 | 1 |
| 2073 | 1 |
| 2074 | 1 |
| 2075 | 1 |
| 2076 | 1 |
| 2077 | 1 |
| 2078 | 1 |
| 2079 | 1 |
| 2080 | 1 |
| 2081 | 1 |
| 2082 | 1 |
| 2083 | 1 |
| 2084 | 1 |
| 2085 | 1 |
| 2086 | 1 |
| 2087 | 1 |
| 2088 | 1 |
| 2089 | 1 |
| 2090 | 1 |
| 2091 | 1 |
| 2092 | 1 |
| 2093 | 1 |
| 2094 | 1 |
| 2095 | 1 |
| 2096 | 1 |
| 2097 | 1 |
| 2098 | 1 |
| 2099 | 1 |
| 2100 | 1 |
| 2101 | 1 |
| 2102 | 1 |
| 2103 | 1 |
| 2104 | 1 |
| 2105 | 1 |
| 2106 | 1 |
| 2107 | 1 |
| 2108 | 1 |
| 2109 | 1 |
| 2110 | 1 |
| 2111 | 1 |
| 2112 | 1 |
| 2113 | 1 |
| 2114 | 1 |
| 2115 | 1 |
| 2116 | 1 |
| 2117 | 1 |
| 2118 | 1 |
| 2119 | 1 |
| 2120 | 1 |
| 2121 | 1 |
| 2122 | 1 |
| 2123 | 1 |
| 2124 | 1 |
| 2125 | 1 |
| 2126 | 1 |
| 2127 | 1 |
| 2128 | 1 |
| 2129 | 1 |
| 2130 | 1 |
| 2131 | 1 |
| 2132 | 1 |
| 2133 | 1 |
| 2134 | 1 |
| 2135 | 1 |
| 2136 | 1 |
| 2137 | 1 |
| 2138 | 1 |
| 2139 | 1 |
| 2140 | 1 |
| 2141 | 1 |
| 2142 | 1 |
| 2143 | 1 |
| 2144 | 1 |
| 2145 | 1 |
| 2146 | 1 |
| 2147 | 1 |
| 2148 | 1 |
| 2149 | 1 |
| 2150 | 1 |
| 2151 | 1 |
| 2152 | 1 |
| 2153 | 1 |
| 2154 | 1 |
| 2155 | 1 |
| 2156 | 1 |
| 2157 | 1 |
| 2158 | 1 |
| 2159 | 1 |
| 2160 | 1 |
| 2161 | 1 |
| 2162 | 1 |
| 2163 | 1 |
| 2164 | 1 |
| 2165 | 1 |
| 2166 | 1 |
| 2167 | 1 |
| 2168 | 1 |
| 2169 | 1 |
| 2170 | 1 |
| 2171 | 1 |
| 2172 | 1 |
| 2173 | 1 |
| 2174 | 1 |
| 2175 | 1 |
| 2176 | 1 |
| 2177 | 1 |
| 2178 | 1 |
| 2179 | 1 |
| 2180 | 1 |
| 2181 | 1 |
| 2182 | 1 |
| 2183 | 1 |
| 2184 | 1 |
| 2185 | 1 |
| 2186 | 1 |
| 2187 | 1 |
| 2188 | 1 |
| 2189 | 1 |
| 2190 | 1 |
| 2191 | 1 |
| 2192 | 1 |
| 2193 | 1 |
| 2194 | 1 |
| 2195 | 1 |
| 2196 | 1 |
| 2197 | 1 |
| 2198 | 1 |
| 2199 | 1 |
| 2200 | 1 |
| 2201 | 1 |
| 2202 | 1 |
| 2203 | 1 |
| 2204 | 1 |
| 2205 | 1 |
| 2206 | 1 |
| 2207 | 1 |
| 2208 | 1 |
| 2209 | 1 |
| 2210 | 1 |
| 2211 | 1 |
| 2212 | 1 |
| 2213 | 1 |
| 2214 | 1 |
| 2215 | 1 |
| 2216 | 1 |
| 2217 | 1 |
| 2218 | 1 |
| 2219 | 1 |
| 2220 | 1 |
| 2221 | 1 |
| 2222 | 1 |
| 2223 | 1 |
| 2224 | 1 |
| 2225 | 1 |
| 2226 | 1 |
| 2227 | 1 |
| 2228 | 1 |
| 2229 | 1 |
| 2230 | 1 |
| 2231 | 1 |
| 2232 | 1 |
| 2233 | 1 |
| 2234 | 1 |
| 2235 | 1 |
| 2236 | 1 |
| 2237 | 1 |
| 2238 | 1 |
| 2239 | 1 |
| 2240 | 1 |
| 2241 | 1 |
| 2242 | 1 |
| 2243 | 1 |
| 2244 | 1 |
| 2245 | 1 |
| 2246 | 1 |
| 2247 | 1 |
| 2248 | 1 |
| 2249 | 1 |
| 2250 | 1 |
| 2251 | 1 |
| 2252 | 1 |
| 2253 | 1 |
| 2254 | 1 |
| 2255 | 1 |
| 2256 | 1 |
| 2257 | 1 |
| 2258 | 1 |
| 2259 | 1 |
| 2260 | 1 |
| 2261 | 1 |
| 2262 | 1 |
| 2263 | 1 |
| 2264 | 1 |
| 2265 | 1 |
| 2266 | 1 |
| 2267 | 1 |
| 2268 | 1 |
| 2269 | 1 |
| 2270 | 1 |
| 2271 | 1 |
| 2272 | 1 |
| 2273 | 1 |
| 2274 | 1 |
| 2275 | 1 |
| 2276 | 1 |
| 2277 | 1 |
| 2278 | 1 |
| 2279 | 1 |
| 2280 | 1 |
| 2281 | 1 |
| 2282 | 1 |
| 2283 | 1 |
| 2284 | 1 |
| 2285 | 1 |
| 2286 | 1 |
| 2287 | 1 |
| 2288 | 1 |
| 2289 | 1 |
| 2290 | 1 |
| 2291 | 1 |
| 2292 | 1 |
| 2293 | 1 |
| 2294 | 1 |
| 2295 | 1 |
| 2296 | 1 |
| 2297 | 1 |
| 2298 | 1 |
| 2299 | 1 |
| 2300 | 1 |
| 2301 | 1 |
| 2302 | 1 |
| 2303 | 1 |
| 2304 | 1 |
| 2305 | 1 |
| 2306 | 1 |
| 2307 | 1 |
| 2308 | 1 |
| 2309 | 1 |
| 2310 | 1 |
| 2311 | 1 |
| 2312 | 1 |
| 2313 | 1 |
| 2314 | 1 |
| 2315 | 1 |
| 2316 | 1 |
| 2317 | 1 |
| 2318 | 1 |
| 2319 | 1 |
| 2320 | 1 |
| 2321 | 1 |
| 2322 | 1 |
| 2323 | 1 |
| 2324 | 1 |
| 2325 | 1 |
| 2326 | 1 |
| 2327 | 1 |
| 2328 | 1 |
| 2329 | 1 |
| 2330 | 1 |
| 2331 | 1 |
| 2332 | 1 |
| 2333 | 1 |
| 2334 | 1 |
| 2335 | 1 |
| 2336 | 1 |
| 2337 | 1 |
| 2338 | 1 |
| 2339 | 1 |
| 2340 | 1 |
| 2341 | 1 |
| 2342 | 1 |
| 2343 | 1 |
| 2344 | 1 |
| 2345 | 1 |
| 2346 | 1 |
| 2347 | 1 |
| 2348 | 1 |
| 2349 | 1 |
| 2350 | 1 |
| 2351 | 1 |
| 2352 | 1 |
| 2353 | 1 |
| 2354 | 1 |
| 2355 | 1 |
| 2356 | 1 |
| 2357 | 1 |
| 2358 | 1 |
| 2359 | 1 |
| 2360 | 1 |
| 2361 | 1 |
| 2362 | 1 |
| 2363 | 1 |
| 2364 | 1 |
| 2365 | 1 |
| 2366 | 1 |
| 2367 | 1 |
| 2368 | 1 |
| 2369 | 1 |
| 2370 | 1 |
| 2371 | 1 |
| 2372 | 1 |
| 2373 | 1 |
| 2374 | 1 |
| 2375 | 1 |
| 2376 | 1 |
| 2377 | 1 |
| 2378 | 1 |
| 2379 | 1 |
| 2380 | 1 |
| 2381 | 1 |
| 2382 | 1 |
| 2383 | 1 |
| 2384 | 1 |
| 2385 | 1 |
| 2386 | 1 |
| 2387 | 1 |
| 2388 | 1 |
| 2389 | 1 |
| 2390 | 1 |
| 2391 | 1 |
| 2392 | 1 |
| 2393 | 1 |
| 2394 | 1 |
| 2395 | 1 |
| 2396 | 1 |
| 2397 | 1 |
| 2398 | 1 |
| 2399 | 1 |
| 2400 | 1 |
| 2401 | 1 |
| 2402 | 1 |
| 2403 | 1 |
| 2404 | 1 |
| 2405 | 1 |
| 2406 | 1 |
| 2407 | 1 |
| 2408 | 1 |
| 2409 | 1 |
| 2410 | 1 |
| 2411 | 1 |
| 2412 | 1 |
| 2413 | 1 |
| 2414 | 1 |
| 2415 | 1 |
| 2416 | 1 |
| 2417 | 1 |
| 2418 | 1 |
| 2419 | 1 |
| 2420 | 1 |
| 2421 | 1 |
| 2422 | 1 |
| 2423 | 1 |
| 2424 | 1 |
| 2425 | 1 |
| 2426 | 1 |
| 2427 | 1 |
| 2428 | 1 |
| 2429 | 1 |
| 2430 | 1 |
| 2431 | 1 |
| 2432 | 1 |
| 2433 | 1 |
| 2434 | 1 |
| 2435 | 1 |
| 2436 | 1 |
| 2437 | 1 |
| 2438 | 1 |
| 2439 | 1 |
| 2440 | 1 |
| 2441 | 1 |
| 2442 | 1 |
| 2443 | 1 |
| 2444 | 1 |
| 2445 | 1 |
| 2446 | 1 |
| 2447 | 1 |
| 2448 | 1 |
| 2449 | 1 |
| 2450 | 1 |
| 2451 | 1 |
| 2452 | 1 |
| 2453 | 1 |
| 2454 | 1 |
| 2455 | 1 |
| 2456 | 1 |
| 2457 | 1 |
| 2458 | 1 |
| 2459 | 1 |
| 2460 | 1 |
| 2461 | 1 |
| 2462 | 1 |
| 2463 | 1 |
| 2464 | 1 |
| 2465 | 1 |
| 2466 | 1 |
| 2467 | 1 |
| 2468 | 1 |
| 2469 | 1 |
| 2470 | 1 |
| 2471 | 1 |
| 2472 | 1 |
| 2473 | 1 |
| 2474 | 1 |
| 2475 | 1 |
| 2476 | 1 |
| 2477 | 1 |
| 2478 | 1 |
| 2479 | 1 |
| 2480 | 1 |
| 2481 | 1 |
| 2482 | 1 |
| 2483 | 1 |
| 2484 | 1 |
| 2485 | 1 |
| 2486 | 1 |
| 2487 | 1 |
| 2488 | 1 |
| 2489 | 1 |
| 2490 | 1 |
| 2491 | 1 |
| 2492 | 1 |
| 2493 | 1 |
| 2494 | 1 |
| 2495 | 1 |
| 2496 | 1 |
| 2497 | 1 |
| 2498 | 1 |
| 2499 | 1 |
| 2500 | 1 |
| 2501 | 1 |
| 2502 | 1 |
| 2503 | 1 |
| 2504 | 1 |
| 2505 | 1 |
| 2506 | 1 |
| 2507 | 1 |
| 2508 | 1 |
| 2509 | 1 |
| 2510 | 1 |
| 2511 | 1 |
| 2512 | 1 |
| 2513 | 1 |
| 2514 | 1 |
| 2515 | 1 |
| 2516 | 1 |
| 2517 | 1 |
| 2518 | 1 |
| 2519 | 1 |
| 2520 | 1 |
| 2521 | 1 |
| 2522 | 1 |
| 2523 | 1 |
| 2524 | 1 |
| 2525 | 1 |
| 2526 | 1 |
| 2527 | 1 |
| 2528 | 1 |
| 2529 | 1 |
| 2530 | 1 |
| 2531 | 1 |
| 2532 | 1 |
| 2533 | 1 |
| 2534 | 1 |
| 2535 | 1 |
| 2536 | 1 |
| 2537 | 1 |
| 2538 | 1 |
| 2539 | 1 |
| 2540 | 1 |
| 2541 | 1 |
| 2542 | 1 |
| 2543 | 1 |
| 2544 | 1 |
| 2545 | 1 |
| 2546 | 1 |
| 2547 | 1 |
| 2548 | 1 |
| 2549 | 1 |
| 2550 | 1 |
| 2551 | 1 |
| 2552 | 1 |
| 2553 | 1 |
| 2554 | 1 |
| 2555 | 1 |
| 2556 | 1 |
| 2557 | 1 |
| 2558 | 1 |
| 2559 | 1 |
| 2560 | 1 |
| 2561 | 1 |
| 2562 | 1 |
| 2563 | 1 |
| 2564 | 1 |
| 2565 | 1 |
| 2566 | 1 |
| 2567 | 1 |
| 2568 | 1 |
| 2569 | 1 |
| 2570 | 1 |
| 2571 | 1 |
| 2572 | 1 |
| 2573 | 1 |
| 2574 | 1 |
| 2575 | 1 |
| 2576 | 1 |
| 2577 | 1 |
| 2578 | 1 |
| 2579 | 1 |
| 2580 | 1 |
| 2581 | 1 |
| 2582 | 1 |
| 2583 | 1 |
| 2584 | 1 |
| 2585 | 1 |
| 2586 | 1 |
| 2587 | 1 |
| 2588 | 1 |
| 2589 | 1 |
| 2590 | 1 |
| 2591 | 1 |
| 2592 | 1 |
| 2593 | 1 |
| 2594 | 1 |
| 2595 | 1 |
| 2596 | 1 |
| 2597 | 1 |
| 2598 | 1 |
| 2599 | 1 |
| 2600 | 1 |
| 2601 | 1 |
| 2602 | 1 |
| 2603 | 1 |
| 2604 | 1 |
| 2605 | 1 |
| 2606 | 1 |
| 2607 | 1 |
| 2608 | 1 |
| 2609 | 1 |
| 2610 | 1 |
| 2611 | 1 |
| 2612 | 1 |
| 2613 | 1 |
| 2614 | 1 |
| 2615 | 1 |
| 2616 | 1 |
| 2617 | 1 |
| 2618 | 1 |
| 2619 | 1 |
| 2620 | 1 |
| 2621 | 1 |
| 2622 | 1 |
| 2623 | 1 |
| 2624 | 1 |
| 2625 | 1 |
| 2626 | 1 |
| 2627 | 1 |
| 2628 | 1 |
| 2629 | 1 |
| 2630 | 1 |
| 2631 | 1 |
| 2632 | 1 |
| 2633 | 1 |
| 2634 | 1 |
| 2635 | 1 |
| 2636 | 1 |
| 2637 | 1 |
| 2638 | 1 |
| 2639 | 1 |
| 2640 | 1 |
| 2641 | 1 |
| 2642 | 1 |
| 2643 | 1 |
| 2644 | 1 |
| 2645 | 1 |
| 2646 | 1 |
| 2647 | 1 |
| 2648 | 1 |
| 2649 | 1 |
| 2650 | 1 |
| 2651 | 1 |
| 2652 | 1 |
| 2653 | 1 |
| 2654 | 1 |
| 2655 | 1 |
| 2656 | 1 |
| 2657 | 1 |
| 2658 | 1 |
| 2659 | 1 |
| 2660 | 1 |
| 2661 | 1 |
| 2662 | 1 |
| 2663 | 1 |
| 2664 | 1 |
| 2665 | 1 |
| 2666 | 1 |
| 2667 | 1 |
| 2668 | 1 |
| 2669 | 1 |
| 2670 | 1 |
| 2671 | 1 |
| 2672 | 1 |
| 2673 | 1 |
| 2674 | 1 |
| 2675 | 1 |
| 2676 | 1 |
| 2677 | 1 |
| 2678 | 1 |
| 2679 | 1 |
| 2680 | 1 |
| 2681 | 1 |
| 2682 | 1 |
| 2683 | 1 |
| 2684 | 1 |
| 2685 | 1 |
| 2686 | 1 |
| 2687 | 1 |
| 2688 | 1 |
| 2689 | 1 |
| 2690 | 1 |
| 2691 | 1 |
| 2692 | 1 |
| 2693 | 1 |
| 2694 | 1 |
| 2695 | 1 |
| 2696 | 1 |
| 2697 | 1 |
| 2698 | 1 |
| 2699 | 1 |
| 2700 | 1 |
| 2701 | 1 |
| 2702 | 1 |
| 2703 | 1 |
| 2704 | 1 |
| 2705 | 1 |
| 2706 | 1 |
| 2707 | 1 |
| 2708 | 1 |
| 2709 | 1 |
| 2710 | 1 |
| 2711 | 1 |
| 2712 | 1 |
| 2713 | 1 |
| 2714 | 1 |
| 2715 | 1 |
| 2716 | 1 |
| 2717 | 1 |
| 2718 | 1 |
| 2719 | 1 |
| 2720 | 1 |
| 2721 | 1 |
| 2722 | 1 |
| 2723 | 1 |
| 2724 | 1 |
| 2725 | 1 |
| 2726 | 1 |
| 2727 | 1 |
| 2728 | 1 |
| 2729 | 1 |
| 2730 | 1 |
| 2731 | 1 |
| 2732 | 1 |
| 2733 | 1 |
| 2734 | 1 |
| 2735 | 1 |
| 2736 | 1 |
| 2737 | 1 |
| 2738 | 1 |
| 2739 | 1 |
| 2740 | 1 |
| 2741 | 1 |
| 2742 | 1 |
| 2743 | 1 |
| 2744 | 1 |
| 2745 | 1 |
| 2746 | 1 |
| 2747 | 1 |
| 2748 | 1 |
| 2749 | 1 |
| 2750 | 1 |
| 2751 | 1 |
| 2752 | 1 |
| 2753 | 1 |
| 2754 | 1 |
| 2755 | 1 |
| 2756 | 1 |
| 2757 | 1 |
| 2758 | 1 |
| 2759 | 1 |
| 2760 | 1 |
| 2761 | 1 |
| 2762 | 1 |
| 2763 | 1 |
| 2764 | 1 |
| 2765 | 1 |
| 2766 | 1 |
| 2767 | 1 |
| 2768 | 1 |
| 2769 | 1 |
| 2770 | 1 |
| 2771 | 1 |
| 2772 | 1 |
| 2773 | 1 |
| 2774 | 1 |
| 2775 | 1 |
| 2776 | 1 |
| 2777 | 1 |
| 2778 | 1 |
| 2779 | 1 |
| 2780 | 1 |
| 2781 | 1 |
| 2782 | 1 |
| 2783 | 1 |
| 2784 | 1 |
| 2785 | 1 |
| 2786 | 1 |
| 2787 | 1 |
| 2788 | 1 |
| 2789 | 1 |
| 2790 | 1 |
| 2791 | 1 |
| 2792 | 1 |
| 2793 | 1 |
| 2794 | 1 |
| 2795 | 1 |
| 2796 | 1 |
| 2797 | 1 |
| 2798 | 1 |
| 2799 | 1 |
| 2800 | 1 |
| 2801 | 1 |
| 2802 | 1 |
| 2803 | 1 |
| 2804 | 1 |
| 2805 | 1 |
| 2806 | 1 |
| 2807 | 1 |
| 2808 | 1 |
| 2809 | 1 |
| 2810 | 1 |
| 2811 | 1 |
| 2812 | 1 |
| 2813 | 1 |
| 2814 | 1 |
| 2815 | 1 |
| 2816 | 1 |
| 2817 | 1 |
| 2818 | 1 |
| 2819 | 1 |
| 2820 | 1 |
| 2821 | 1 |
| 2822 | 1 |
| 2823 | 1 |
| 2824 | 1 |
| 2825 | 1 |
| 2826 | 1 |
| 2827 | 1 |
| 2828 | 1 |
| 2829 | 1 |
| 2830 | 1 |
| 2831 | 1 |
| 2832 | 1 |
| 2833 | 1 |
| 2834 | 1 |
| 2835 | 1 |
| 2836 | 1 |
| 2837 | 1 |
| 2838 | 1 |
| 2839 | 1 |
| 2840 | 1 |
| 2841 | 1 |
| 2842 | 1 |
| 2843 | 1 |
| 2844 | 1 |
| 2845 | 1 |
| 2846 | 1 |
| 2847 | 1 |
| 2848 | 1 |
| 2849 | 1 |
| 2850 | 1 |
| 2851 | 1 |
| 2852 | 1 |
| 2853 | 1 |
| 2854 | 1 |
| 2855 | 1 |
| 2856 | 1 |
| 2857 | 1 |
| 2858 | 1 |
| 2859 | 1 |
| 2860 | 1 |
| 2861 | 1 |
| 2862 | 1 |
| 2863 | 1 |
| 2864 | 1 |
| 2865 | 1 |
| 2866 | 1 |
| 2867 | 1 |
| 2868 | 1 |
| 2869 | 1 |
| 2870 | 1 |
| 2871 | 1 |
| 2872 | 1 |
| 2873 | 1 |
| 2874 | 1 |
| 2875 | 1 |
| 2876 | 1 |
| 2877 | 1 |
| 2878 | 1 |
| 2879 | 1 |
| 2880 | 1 |
| 2881 | 1 |
| 2882 | 1 |
| 2883 | 1 |
| 2884 | 1 |
| 2885 | 1 |
| 2886 | 1 |
| 2887 | 1 |
| 2888 | 1 |
| 2889 | 1 |
| 2890 | 1 |
| 2891 | 1 |
| 2892 | 1 |
| 2893 | 1 |
| 2894 | 1 |
| 2895 | 1 |
| 2896 | 1 |
| 2897 | 1 |
| 2898 | 1 |
| 2899 | 1 |
| 2900 | 1 |
| 2901 | 1 |
| 2902 | 1 |
| 2903 | 1 |
| 2904 | 1 |
| 2905 | 1 |
| 2906 | 1 |
| 2907 | 1 |
| 2908 | 1 |
| 2909 | 1 |
| 2910 | 1 |
| 2911 | 1 |
| 2912 | 1 |
| 2913 | 1 |
| 2914 | 1 |
| 2915 | 1 |
| 2916 | 1 |
| 2917 | 1 |
| 2918 | 1 |
| 2919 | 1 |
| 2920 | 1 |
| 2921 | 1 |
| 2922 | 1 |
| 2923 | 1 |
| 2924 | 1 |
| 2925 | 1 |
| 2926 | 1 |
| 2927 | 1 |
| 2928 | 1 |
| 2929 | 1 |
| 2930 | 1 |
| 2931 | 1 |
| 2932 | 1 |
| 2933 | 1 |
| 2934 | 1 |
| 2935 | 1 |
| 2936 | 1 |
| 2937 | 1 |
| 2938 | 1 |
| 2939 | 1 |
| 2940 | 1 |
| 2941 | 1 |
| 2942 | 1 |
| 2943 | 1 |
| 2944 | 1 |
| 2945 | 1 |
| 2946 | 1 |
| 2947 | 1 |
| 2948 | 1 |
| 2949 | 1 |
| 2950 | 1 |
| 2951 | 1 |
| 2952 | 1 |
| 2953 | 1 |
| 2954 | 1 |
| 2955 | 1 |
| 2956 | 1 |
| 2957 | 1 |
| 2958 | 1 |
| 2959 | 1 |
| 2960 | 1 |
| 2961 | 1 |
| 2962 | 1 |
| 2963 | 1 |
| 2964 | 1 |
| 2965 | 1 |
| 2966 | 1 |
| 2967 | 1 |
| 2968 | 1 |
| 2969 | 1 |
| 2970 | 1 |
| 2971 | 1 |
| 2972 | 1 |
| 2973 | 1 |
| 2974 | 1 |
| 2975 | 1 |
| 2976 | 1 |
| 2977 | 1 |
| 2978 | 1 |
| 2979 | 1 |
| 2980 | 1 |
| 2981 | 1 |
| 2982 | 1 |
| 2983 | 1 |
| 2984 | 1 |
| 2985 | 1 |
| 2986 | 1 |
| 2987 | 1 |
| 2988 | 1 |
| 2989 | 1 |
| 2990 | 1 |
| 2991 | 1 |
| 2992 | 1 |
| 2993 | 1 |
| 2994 | 1 |
| 2995 | 1 |
| 2996 | 1 |
| 2997 | 1 |
| 2998 | 1 |
| 2999 | 1 |
| 3000 | 1 |
| 3001 | 1 |
| 3002 | 1 |
| 3003 | 1 |
| 3004 | 1 |
| 3005 | 1 |
| 3006 | 1 |
| 3007 | 1 |
| 3008 | 1 |
| 3009 | 1 |
| 3010 | 1 |
| 3011 | 1 |
| 3012 | 1 |
| 3013 | 1 |
| 3014 | 1 |
| 3015 | 1 |
| 3016 | 1 |
| 3017 | 1 |
| 3018 | 1 |
| 3019 | 1 |
| 3020 | 1 |
| 3021 | 1 |
| 3022 | 1 |
| 3023 | 1 |
| 3024 | 1 |
| 3025 | 1 |
| 3026 | 1 |
| 3027 | 1 |
| 3028 | 1 |
| 3029 | 1 |
| 3030 | 1 |
| 3031 | 1 |
| 3032 | 1 |
| 3033 | 1 |
| 3034 | 1 |
| 3035 | 1 |
| 3036 | 1 |
| 3037 | 1 |
| 3038 | 1 |
| 3039 | 1 |
| 3040 | 1 |
| 3041 | 1 |
| 3042 | 1 |
| 3043 | 1 |
| 3044 | 1 |
| 3045 | 1 |
| 3046 | 1 |
| 3047 | 1 |
| 3048 | 1 |
| 3049 | 1 |
| 3050 | 1 |
| 3051 | 1 |
| 3052 | 1 |
| 3053 | 1 |
| 3054 | 1 |
| 3055 | 1 |
| 3056 | 1 |
| 3057 | 1 |
| 3058 | 1 |
| 3059 | 1 |
| 3060 | 1 |
| 3061 | 1 |
| 3062 | 1 |
| 3063 | 1 |
| 3064 | 1 |
| 3065 | 1 |
| 3066 | 1 |
| 3067 | 1 |
| 3068 | 1 |
| 3069 | 1 |
| 3070 | 1 |
| 3071 | 1 |
| 3072 | 1 |
| 3073 | 1 |
| 3074 | 1 |
| 3075 | 1 |
| 3076 | 1 |
| 3077 | 1 |
| 3078 | 1 |
| 3079 | 1 |
| 3080 | 1 |
| 3081 | 1 |
| 3082 | 1 |
| 3083 | 1 |
| 3084 | 1 |
| 3085 | 1 |
| 3086 | 1 |
| 3087 | 1 |
| 3088 | 1 |
| 3089 | 1 |
| 3090 | 1 |
| 3091 | 1 |
| 3092 | 1 |
| 3093 | 1 |
| 3094 | 1 |
| 3095 | 1 |
| 3096 | 1 |
| 3097 | 1 |
| 3098 | 1 |
| 3099 | 1 |
| 3100 | 1 |
| 3101 | 1 |
| 3102 | 1 |
| 3103 | 1 |
| 3104 | 1 |
| 3105 | 1 |
| 3106 | 1 |
| 3107 | 1 |
| 3108 | 1 |
| 3109 | 1 |
| 3110 | 1 |
| 3111 | 1 |
| 3112 | 1 |
| 3113 | 1 |
| 3114 | 1 |
| 3115 | 1 |
| 3116 | 1 |
| 3117 | 1 |
| 3118 | 1 |
| 3119 | 1 |
| 3120 | 1 |
| 3121 | 1 |
| 3122 | 1 |
| 3123 | 1 |
| 3124 | 1 |
| 3125 | 1 |
| 3126 | 1 |
| 3127 | 1 |
| 3128 | 1 |
| 3129 | 1 |
| 3130 | 1 |
| 3131 | 1 |
| 3132 | 1 |
| 3133 | 1 |
| 3134 | 1 |
| 3135 | 1 |
| 3136 | 1 |
| 3137 | 1 |
| 3138 | 1 |
| 3139 | 1 |
| 3140 | 1 |
| 3141 | 1 |
| 3142 | 1 |
| 3143 | 1 |
| 3144 | 1 |
| 3145 | 1 |
| 3146 | 1 |
| 3147 | 1 |
| 3148 | 1 |
| 3149 | 1 |
| 3150 | 1 |
| 3151 | 1 |
| 3152 | 1 |
| 3153 | 1 |
| 3154 | 1 |
| 3155 | 1 |
| 3156 | 1 |
| 3157 | 1 |
| 3158 | 1 |
| 3159 | 1 |
| 3160 | 1 |
| 3161 | 1 |
| 3162 | 1 |
| 3163 | 1 |
| 3164 | 1 |
| 3165 | 1 |
| 3166 | 1 |
| 3167 | 1 |
| 3168 | 1 |
| 3169 | 1 |
| 3170 | 1 |
| 3171 | 1 |
| 3172 | 1 |
| 3173 | 1 |
| 3174 | 1 |
| 3175 | 1 |
| 3176 | 1 |
| 3177 | 1 |
| 3178 | 1 |
| 3179 | 1 |
| 3180 | 1 |
| 3181 | 1 |
| 3182 | 1 |
| 3183 | 1 |
| 3184 | 1 |
| 3185 | 1 |
| 3186 | 1 |
| 3187 | 1 |
| 3188 | 1 |
| 3189 | 1 |
| 3190 | 1 |
| 3191 | 1 |
| 3192 | 1 |
| 3193 | 1 |
| 3194 | 1 |
| 3195 | 1 |
| 3196 | 1 |
| 3197 | 1 |
| 3198 | 1 |
| 3199 | 1 |
| 3200 | 1 |
| 3201 | 1 |
| 3202 | 1 |
| 3203 | 1 |
| 3204 | 1 |
| 3205 | 1 |
| 3206 | 1 |
| 3207 | 1 |
| 3208 | 1 |
| 3209 | 1 |
| 3210 | 1 |
| 3211 | 1 |
| 3212 | 1 |
| 3213 | 1 |
| 3214 | 1 |
| 3215 | 1 |
| 3216 | 1 |
| 3217 | 1 |
| 3218 | 1 |
| 3219 | 1 |
| 3220 | 1 |
| 3221 | 1 |
| 3222 | 1 |
| 3223 | 1 |
| 3224 | 1 |
| 3225 | 1 |
| 3226 | 1 |
| 3227 | 1 |
| 3228 | 1 |
| 3229 | 1 |
| 3230 | 1 |
| 3231 | 1 |
| 3232 | 1 |
| 3233 | 1 |
| 3234 | 1 |
| 3235 | 1 |
| 3236 | 1 |
| 3237 | 1 |
| 3238 | 1 |
| 3239 | 1 |
| 3240 | 1 |
| 3241 | 1 |
| 3242 | 1 |
| 3243 | 1 |
| 3244 | 1 |
| 3245 | 1 |
| 3246 | 1 |
| 3247 | 1 |
| 3248 | 1 |
| 3249 | 1 |
| 3250 | 1 |
| 3251 | 1 |
| 3252 | 1 |
| 3253 | 1 |
| 3254 | 1 |
| 3255 | 1 |
| 3256 | 1 |
| 3257 | 1 |
| 3258 | 1 |
| 3259 | 1 |
| 3260 | 1 |
| 3261 | 1 |
| 3262 | 1 |
| 3263 | 1 |
| 3264 | 1 |
| 3265 | 1 |
| 3266 | 1 |
| 3267 | 1 |
| 3268 | 1 |
| 3269 | 1 |
| 3270 | 1 |
| 3271 | 1 |
| 3272 | 1 |
| 3273 | 1 |
| 3274 | 1 |
| 3275 | 1 |
| 3276 | 1 |
| 3277 | 1 |
| 3278 | 1 |
| 3279 | 1 |
| 3280 | 1 |
| 3281 | 1 |
| 3282 | 1 |
| 3283 | 1 |
| 3284 | 1 |
| 3285 | 1 |
| 3286 | 1 |
| 3287 | 1 |
| 3288 | 1 |
| 3289 | 1 |
| 3290 | 1 |
| 3291 | 1 |
| 3292 | 1 |
| 3293 | 1 |
| 3294 | 1 |
| 3295 | 1 |
| 3296 | 1 |
| 3297 | 1 |
| 3298 | 1 |
| 3299 | 1 |
| 3300 | 1 |
| 3301 | 1 |
| 3302 | 1 |
| 3303 | 1 |
| 3304 | 1 |
| 3305 | 1 |
| 3306 | 1 |
| 3307 | 1 |
| 3308 | 1 |
| 3309 | 1 |
| 3310 | 1 |
| 3311 | 1 |
| 3312 | 1 |
| 3313 | 1 |
| 3314 | 1 |
| 3315 | 1 |
| 3316 | 1 |
| 3317 | 1 |
| 3318 | 1 |
| 3319 | 1 |
| 3320 | 1 |
| 3321 | 1 |
| 3322 | 1 |
| 3323 | 1 |
| 3324 | 1 |
| 3325 | 1 |
| 3326 | 1 |
| 3327 | 1 |
| 3328 | 1 |
| 3329 | 1 |
| 3330 | 1 |
| 3331 | 1 |
| 3332 | 1 |
| 3333 | 1 |
| 3334 | 1 |
| 3335 | 1 |
| 3336 | 1 |
| 3337 | 1 |
| 3338 | 1 |
| 3339 | 1 |
| 3340 | 1 |
| 3341 | 1 |
| 3342 | 1 |
| 3343 | 1 |
| 3344 | 1 |
| 3345 | 1 |
| 3346 | 1 |
| 3347 | 1 |
| 3348 | 1 |
| 3349 | 1 |
| 3350 | 1 |
| 3351 | 1 |
| 3352 | 1 |
| 3353 | 1 |
| 3354 | 1 |
| 3355 | 1 |
| 3356 | 1 |
| 3357 | 1 |
| 3358 | 1 |
| 3359 | 1 |
| 3360 | 1 |
| 3361 | 1 |
| 3362 | 1 |
| 3363 | 1 |
| 3364 | 1 |
| 3365 | 1 |
| 3366 | 1 |
| 3367 | 1 |
| 3368 | 1 |
| 3369 | 1 |
| 3370 | 1 |
| 3371 | 1 |
| 3372 | 1 |
| 3373 | 1 |
| 3374 | 1 |
| 3375 | 1 |
| 3376 | 1 |
| 3377 | 1 |
| 3378 | 1 |
| 3379 | 1 |
| 3380 | 1 |
| 3381 | 1 |
| 3382 | 1 |
| 3383 | 1 |
| 3384 | 1 |
| 3385 | 1 |
| 3386 | 1 |
| 3387 | 1 |
| 3388 | 1 |
| 3389 | 1 |
| 3390 | 1 |
| 3391 | 1 |
| 3392 | 1 |
| 3393 | 1 |
| 3394 | 1 |
| 3395 | 1 |
| 3396 | 1 |
| 3397 | 1 |
| 3398 | 1 |
| 3399 | 1 |
| 3400 | 1 |
| 3401 | 1 |
| 3402 | 1 |
| 3403 | 1 |
| 3404 | 1 |
| 3405 | 1 |
| 3406 | 1 |
| 3407 | 1 |
| 3408 | 1 |
| 3409 | 1 |
| 3410 | 1 |
| 3411 | 1 |
| 3412 | 1 |
| 3413 | 1 |
| 3414 | 1 |
| 3415 | 1 |
| 3416 | 1 |
| 3417 | 1 |
| 3418 | 1 |
| 3419 | 1 |
| 3420 | 1 |
| 3421 | 1 |
| 3422 | 1 |
| 3423 | 1 |
| 3424 | 1 |
| 3425 | 1 |
| 3426 | 1 |
| 3427 | 1 |
| 3428 | 1 |
| 3429 | 1 |
| 3430 | 1 |
| 3431 | 1 |
| 3432 | 1 |
| 3433 | 1 |
| 3434 | 1 |
| 3435 | 1 |
| 3436 | 1 |
| 3437 | 1 |
| 3438 | 1 |
| 3439 | 1 |
| 3440 | 1 |
| 3441 | 1 |
| 3442 | 1 |
| 3443 | 1 |
| 3444 | 1 |
| 3445 | 1 |
| 3446 | 1 |
| 3447 | 1 |
| 3448 | 1 |
| 3449 | 1 |
| 3450 | 1 |
| 3451 | 1 |
| 3452 | 1 |
| 3453 | 1 |
| 3454 | 1 |
| 3455 | 1 |
| 3456 | 1 |
| 3457 | 1 |
| 3458 | 1 |
| 3459 | 1 |
| 3460 | 1 |
| 3461 | 1 |
| 3462 | 1 |
| 3463 | 1 |
| 3464 | 1 |
| 3465 | 1 |
| 3466 | 1 |
| 3467 | 1 |
| 3468 | 1 |
| 3469 | 1 |
| 3470 | 1 |
| 3471 | 1 |
| 3472 | 1 |
| 3473 | 1 |
| 3474 | 1 |
| 3475 | 1 |
| 3476 | 1 |
| 3477 | 1 |
| 3478 | 1 |
| 3479 | 1 |
| 3480 | 1 |
| 3481 | 1 |
| 3482 | 1 |
| 3483 | 1 |
| 3484 | 1 |
| 3485 | 1 |
| 3486 | 1 |
| 3487 | 1 |
| 3488 | 1 |
| 3489 | 1 |
| 3490 | 1 |
| 3491 | 1 |
| 3492 | 1 |
| 3493 | 1 |
| 3494 | 1 |
| 3495 | 1 |
| 3496 | 1 |
| 3497 | 1 |
| 3498 | 1 |
| 3499 | 1 |
| 3500 | 1 |
| 3501 | 1 |
| 3502 | 1 |
| 3503 | 1 |
| 3504 | 1 |
| 3505 | 1 |
| 3506 | 1 |
| 3507 | 1 |
| 3508 | 1 |
| 3509 | 1 |
| 3510 | 1 |
| 3511 | 1 |
| 3512 | 1 |
| 3513 | 1 |
| 3514 | 1 |
| 3515 | 1 |
| 3516 | 1 |
| 3517 | 1 |
| 3518 | 1 |
| 3519 | 1 |
| 3520 | 1 |
| 3521 | 1 |
| 3522 | 1 |
| 3523 | 1 |
| 3524 | 1 |
| 3525 | 1 |
| 3526 | 1 |
| 3527 | 1 |
| 3528 | 1 |
| 3529 | 1 |
| 3530 | 1 |
| 3531 | 1 |
| 3532 | 1 |
| 3533 | 1 |
| 3534 | 1 |
| 3535 | 1 |
| 3536 | 1 |
| 3537 | 1 |
| 3538 | 1 |
| 3539 | 1 |
| 3540 | 1 |
| 3541 | 1 |
| 3542 | 1 |
| 3543 | 1 |
| 3544 | 1 |
| 3545 | 1 |
| 3546 | 1 |
| 3547 | 1 |
| 3548 | 1 |
| 3549 | 1 |
| 3550 | 1 |
| 3551 | 1 |
| 3552 | 1 |
| 3553 | 1 |
| 3554 | 1 |
| 3555 | 1 |
| 3556 | 1 |
| 3557 | 1 |
| 3558 | 1 |
| 3559 | 1 |
| 3560 | 1 |
| 3561 | 1 |
| 3562 | 1 |
| 3563 | 1 |
| 3564 | 1 |
| 3565 | 1 |
| 3566 | 1 |
| 3567 | 1 |
| 3568 | 1 |
| 3569 | 1 |
| 3570 | 1 |
| 3571 | 1 |
| 3572 | 1 |
| 3573 | 1 |
| 3574 | 1 |
| 3575 | 1 |
| 3576 | 1 |
| 3577 | 1 |
| 3578 | 1 |
| 3579 | 1 |
| 3580 | 1 |
| 3581 | 1 |
| 3582 | 1 |
| 3583 | 1 |
| 3584 | 1 |
| 3585 | 1 |
| 3586 | 1 |
| 3587 | 1 |
| 3588 | 1 |
| 3589 | 1 |
| 3590 | 1 |
| 3591 | 1 |
| 3592 | 1 |
| 3593 | 1 |
| 3594 | 1 |
| 3595 | 1 |
| 3596 | 1 |
| 3597 | 1 |
| 3598 | 1 |
| 3599 | 1 |
| 3600 | 1 |
| 3601 | 1 |
| 3602 | 1 |
| 3603 | 1 |
| 3604 | 1 |
| 3605 | 1 |
| 3606 | 1 |
| 3607 | 1 |
| 3608 | 1 |
| 3609 | 1 |
| 3610 | 1 |
| 3611 | 1 |
| 3612 | 1 |
| 3613 | 1 |
| 3614 | 1 |
| 3615 | 1 |
| 3616 | 1 |
| 3617 | 1 |
| 3618 | 1 |
| 3619 | 1 |
| 3620 | 1 |
| 3621 | 1 |
| 3622 | 1 |
| 3623 | 1 |
| 3624 | 1 |
| 3625 | 1 |
| 3626 | 1 |
| 3627 | 1 |
| 3628 | 1 |
| 3629 | 1 |
| 3630 | 1 |
| 3631 | 1 |
| 3632 | 1 |
| 3633 | 1 |
| 3634 | 1 |
| 3635 | 1 |
| 3636 | 1 |
| 3637 | 1 |
| 3638 | 1 |
| 3639 | 1 |
| 3640 | 1 |
| 3641 | 1 |
| 3642 | 1 |
| 3643 | 1 |
| 3644 | 1 |
| 3645 | 1 |
| 3646 | 1 |
| 3647 | 1 |
| 3648 | 1 |
| 3649 | 1 |
| 3650 | 1 |
| 3651 | 1 |
| 3652 | 1 |
| 3653 | 1 |
| 3654 | 1 |
| 3655 | 1 |
| 3656 | 1 |
| 3657 | 1 |
| 3658 | 1 |
| 3659 | 1 |
| 3660 | 1 |
| 3661 | 1 |
| 3662 | 1 |
| 3663 | 1 |
| 3664 | 1 |
| 3665 | 1 |
| 3666 | 1 |
| 3667 | 1 |
| 3668 | 1 |
| 3669 | 1 |
| 3670 | 1 |
| 3671 | 1 |
| 3672 | 1 |
| 3673 | 1 |
| 3674 | 1 |
| 3675 | 1 |
| 3676 | 1 |
| 3677 | 1 |
| 3678 | 1 |
| 3679 | 1 |
| 3680 | 1 |
| 3681 | 1 |
| 3682 | 1 |
| 3683 | 1 |
| 3684 | 1 |
| 3685 | 1 |
| 3686 | 1 |
| 3687 | 1 |
| 3688 | 1 |
| 3689 | 1 |
| 3690 | 1 |
| 3691 | 1 |
| 3692 | 1 |
| 3693 | 1 |
| 3694 | 1 |
| 3695 | 1 |
| 3696 | 1 |
| 3697 | 1 |
| 3698 | 1 |
| 3699 | 1 |
| 3700 | 1 |
| 3701 | 1 |
| 3702 | 1 |
| 3703 | 1 |
| 3704 | 1 |
| 3705 | 1 |
| 3706 | 1 |
| 3707 | 1 |
| 3708 | 1 |
| 3709 | 1 |
| 3710 | 1 |
| 3711 | 1 |
| 3712 | 1 |
| 3713 | 1 |
| 3714 | 1 |
| 3715 | 1 |
| 3716 | 1 |
| 3717 | 1 |
| 3718 | 1 |
| 3719 | 1 |
| 3720 | 1 |
| 3721 | 1 |
| 3722 | 1 |
| 3723 | 1 |
| 3724 | 1 |
| 3725 | 1 |
| 3726 | 1 |
| 3727 | 1 |
| 3728 | 1 |
| 3729 | 1 |
| 3730 | 1 |
| 3731 | 1 |
| 3732 | 1 |
| 3733 | 1 |
| 3734 | 1 |
| 3735 | 1 |
| 3736 | 1 |
| 3737 | 1 |
| 3738 | 1 |
| 3739 | 1 |
| 3740 | 1 |
| 3741 | 1 |
| 3742 | 1 |
| 3743 | 1 |
| 3744 | 1 |
| 3745 | 1 |
| 3746 | 1 |
| 3747 | 1 |
| 3748 | 1 |
| 3749 | 1 |
| 3750 | 1 |
| 3751 | 1 |
| 3752 | 1 |
| 3753 | 1 |
| 3754 | 1 |
| 3755 | 1 |
| 3756 | 1 |
| 3757 | 1 |
| 3758 | 1 |
| 3759 | 1 |
| 3760 | 1 |
| 3761 | 1 |
| 3762 | 1 |
| 3763 | 1 |
| 3764 | 1 |
| 3765 | 1 |
| 3766 | 1 |
| 3767 | 1 |
| 3768 | 1 |
| 3769 | 1 |
| 3770 | 1 |
| 3771 | 1 |
| 3772 | 1 |
| 3773 | 1 |
| 3774 | 1 |
| 3775 | 1 |
| 3776 | 1 |
| 3777 | 1 |
| 3778 | 1 |
| 3779 | 1 |
| 3780 | 1 |
| 3781 | 1 |
| 3782 | 1 |
| 3783 | 1 |
| 3784 | 1 |
| 3785 | 1 |
| 3786 | 1 |
| 3787 | 1 |
| 3788 | 1 |
| 3789 | 1 |
| 3790 | 1 |
| 3791 | 1 |
| 3792 | 1 |
| 3793 | 1 |
| 3794 | 1 |
| 3795 | 1 |
| 3796 | 1 |
| 3797 | 1 |
| 3798 | 1 |
| 3799 | 1 |
| 3800 | 1 |
| 3801 | 1 |
| 3802 | 1 |
| 3803 | 1 |
| 3804 | 1 |
| 3805 | 1 |
| 3806 | 1 |
| 3807 | 1 |
| 3808 | 1 |
| 3809 | 1 |
| 3810 | 1 |
| 3811 | 1 |
| 3812 | 1 |
| 3813 | 1 |
| 3814 | 1 |
| 3815 | 1 |
| 3816 | 1 |
| 3817 | 1 |
| 3818 | 1 |
| 3819 | 1 |
| 3820 | 1 |
| 3821 | 1 |
| 3822 | 1 |
| 3823 | 1 |
| 3824 | 1 |
| 3825 | 1 |
| 3826 | 1 |
| 3827 | 1 |
| 3828 | 1 |
| 3829 | 1 |
| 3830 | 1 |
| 3831 | 1 |
| 3832 | 1 |
| 3833 | 1 |
| 3834 | 1 |
| 3835 | 1 |
| 3836 | 1 |
| 3837 | 1 |
| 3838 | 1 |
| 3839 | 1 |
| 3840 | 1 |
| 3841 | 1 |
| 3842 | 1 |
| 3843 | 1 |
| 3844 | 1 |
| 3845 | 1 |
| 3846 | 1 |
| 3847 | 1 |
| 3848 | 1 |
| 3849 | 1 |
| 3850 | 1 |
| 3851 | 1 |
| 3852 | 1 |
| 3853 | 1 |
| 3854 | 1 |
| 3855 | 1 |
| 3856 | 1 |
| 3857 | 1 |
| 3858 | 1 |
| 3859 | 1 |
| 3860 | 1 |
| 3861 | 1 |
| 3862 | 1 |
| 3863 | 1 |
| 3864 | 1 |
| 3865 | 1 |
| 3866 | 1 |
| 3867 | 1 |
| 3868 | 1 |
| 3869 | 1 |
| 3870 | 1 |
| 3871 | 1 |
| 3872 | 1 |
| 3873 | 1 |
| 3874 | 1 |
| 3875 | 1 |
| 3876 | 1 |
| 3877 | 1 |
| 3878 | 1 |
| 3879 | 1 |
| 3880 | 1 |
| 3881 | 1 |
| 3882 | 1 |
| 3883 | 1 |
| 3884 | 1 |
| 3885 | 1 |
| 3886 | 1 |
| 3887 | 1 |
| 3888 | 1 |
| 3889 | 1 |
| 3890 | 1 |
| 3891 | 1 |
| 3892 | 1 |
| 3893 | 1 |
| 3894 | 1 |
| 3895 | 1 |
| 3896 | 1 |
| 3897 | 1 |
| 3898 | 1 |
| 3899 | 1 |
| 3900 | 1 |
| 3901 | 1 |
| 3902 | 1 |
| 3903 | 1 |
| 3904 | 1 |
| 3905 | 1 |
| 3906 | 1 |
| 3907 | 1 |
| 3908 | 1 |
| 3909 | 1 |
| 3910 | 1 |
| 3911 | 1 |
| 3912 | 1 |
| 3913 | 1 |
| 3914 | 1 |
| 3915 | 1 |
| 3916 | 1 |
| 3917 | 1 |
| 3918 | 1 |
| 3919 | 1 |
| 3920 | 1 |
| 3921 | 1 |
| 3922 | 1 |
| 3923 | 1 |
| 3924 | 1 |
| 3925 | 1 |
| 3926 | 1 |
| 3927 | 1 |
| 3928 | 1 |
| 3929 | 1 |
| 3930 | 1 |
| 3931 | 1 |
| 3932 | 1 |
| 3933 | 1 |
| 3934 | 1 |
| 3935 | 1 |
| 3936 | 1 |
| 3937 | 1 |
| 3938 | 1 |
| 3939 | 1 |
| 3940 | 1 |
| 3941 | 1 |
| 3942 | 1 |
| 3943 | 1 |
| 3944 | 1 |
| 3945 | 1 |
| 3946 | 1 |
| 3947 | 1 |
| 3948 | 1 |
| 3949 | 1 |
| 3950 | 1 |
| 3951 | 1 |
| 3952 | 1 |
| 3953 | 1 |
| 3954 | 1 |
| 3955 | 1 |
| 3956 | 1 |
| 3957 | 1 |
| 3958 | 1 |
| 3959 | 1 |
| 3960 | 1 |
| 3961 | 1 |
| 3962 | 1 |
| 3963 | 1 |
| 3964 | 1 |
| 3965 | 1 |
| 3966 | 1 |
| 3967 | 1 |
| 3968 | 1 |
| 3969 | 1 |
| 3970 | 1 |
| 3971 | 1 |
| 3972 | 1 |
| 3973 | 1 |
| 3974 | 1 |
| 3975 | 1 |
| 3976 | 1 |
| 3977 | 1 |
| 3978 | 1 |
| 3979 | 1 |
| 3980 | 1 |
| 3981 | 1 |
| 3982 | 1 |
| 3983 | 1 |
| 3984 | 1 |
| 3985 | 1 |
| 3986 | 1 |
| 3987 | 1 |
| 3988 | 1 |
| 3989 | 1 |
| 3990 | 1 |
| 3991 | 1 |
| 3992 | 1 |
| 3993 | 1 |
| 3994 | 1 |
| 3995 | 1 |
| 3996 | 1 |
| 3997 | 1 |
| 3998 | 1 |
| 3999 | 1 |
| 4000 | 1 |
| 4001 | 1 |
| 4002 | 1 |
| 4003 | 1 |
| 4004 | 1 |
| 4005 | 1 |
| 4006 | 1 |
| 4007 | 1 |
| 4008 | 1 |
| 4009 | 1 |
| 4010 | 1 |
| 4011 | 1 |
| 4012 | 1 |
| 4013 | 1 |
| 4014 | 1 |
| 4015 | 1 |
| 4016 | 1 |
| 4017 | 1 |
| 4018 | 1 |
| 4019 | 1 |
| 4020 | 1 |
| 4021 | 1 |
| 4022 | 1 |
| 4023 | 1 |
| 4024 | 1 |
| 4025 | 1 |
| 4026 | 1 |
| 4027 | 1 |
| 4028 | 1 |
| 4029 | 1 |
| 4030 | 1 |
| 4031 | 1 |
| 4032 | 1 |
| 4033 | 1 |
| 4034 | 1 |
| 4035 | 1 |
| 4036 | 1 |
| 4037 | 1 |
| 4038 | 1 |
| 4039 | 1 |
| 4040 | 1 |
| 4041 | 1 |
| 4042 | 1 |
| 4043 | 1 |
| 4044 | 1 |
| 4045 | 1 |
| 4046 | 1 |
| 4047 | 1 |
| 4048 | 1 |
| 4049 | 1 |
| 4050 | 1 |
| 4051 | 1 |
| 4052 | 1 |
| 4053 | 1 |
| 4054 | 1 |
| 4055 | 1 |
| 4056 | 1 |
| 4057 | 1 |
| 4058 | 1 |
| 4059 | 1 |
| 4060 | 1 |
| 4061 | 1 |
| 4062 | 1 |
| 4063 | 1 |
| 4064 | 1 |
| 4065 | 1 |
| 4066 | 1 |
| 4067 | 1 |
| 4068 | 1 |
| 4069 | 1 |
| 4070 | 1 |
| 4071 | 1 |
| 4072 | 1 |
| 4073 | 1 |
| 4074 | 1 |
| 4075 | 1 |
| 4076 | 1 |
| 4077 | 1 |
| 4078 | 1 |
| 4079 | 1 |
| 4080 | 1 |
| 4081 | 1 |
| 4082 | 1 |
| 4083 | 1 |
| 4084 | 1 |
| 4085 | 1 |
| 4086 | 1 |
| 4087 | 1 |
| 4088 | 1 |
| 4089 | 1 |
| 4090 | 1 |
| 4091 | 1 |
| 4092 | 1 |
| 4093 | 1 |
| 4094 | 1 |
| 4095 | 1 |
| 4096 | 1 |
| 4097 | 1 |
| 4098 | 1 |
| 4099 | 1 |
| 4100 | 1 |
| 4101 | 1 |
| 4102 | 1 |
| 4103 | 1 |
| 4104 | 1 |
| 4105 | 1 |
| 4106 | 1 |
| 4107 | 1 |
| 4108 | 1 |
| 4109 | 1 |
| 4110 | 1 |
| 4111 | 1 |
| 4112 | 1 |
| 4113 | 1 |
| 4114 | 1 |
| 4115 | 1 |
| 4116 | 1 |
| 4117 | 1 |
| 4118 | 1 |
| 4119 | 1 |
| 4120 | 1 |
| 4121 | 1 |
| 4122 | 1 |
| 4123 | 1 |
| 4124 | 1 |
| 4125 | 1 |
| 4126 | 1 |
| 4127 | 1 |
| 4128 | 1 |
| 4129 | 1 |
| 4130 | 1 |
| 4131 | 1 |
| 4132 | 1 |
| 4133 | 1 |
| 4134 | 1 |
| 4135 | 1 |
| 4136 | 1 |
| 4137 | 1 |
| 4138 | 1 |
| 4139 | 1 |
| 4140 | 1 |
| 4141 | 1 |
| 4142 | 1 |
| 4143 | 1 |
| 4144 | 1 |
| 4145 | 1 |
| 4146 | 1 |
| 4147 | 1 |
| 4148 | 1 |
| 4149 | 1 |
| 4150 | 1 |
| 4151 | 1 |
| 4152 | 1 |
| 4153 | 1 |
| 4154 | 1 |
| 4155 | 1 |
| 4156 | 1 |
| 4157 | 1 |
| 4158 | 1 |
| 4159 | 1 |
| 4160 | 1 |
| 4161 | 1 |
| 4162 | 1 |
| 4163 | 1 |
| 4164 | 1 |
| 4165 | 1 |
| 4166 | 1 |
| 4167 | 1 |
| 4168 | 1 |
| 4169 | 1 |
| 4170 | 1 |
| 4171 | 1 |
| 4172 | 1 |
| 4173 | 1 |
| 4174 | 1 |
| 4175 | 1 |
| 4176 | 1 |
| 4177 | 1 |
| 4178 | 1 |
| 4179 | 1 |
| 4180 | 1 |
| 4181 | 1 |
| 4182 | 1 |
| 4183 | 1 |
| 4184 | 1 |
| 4185 | 1 |
| 4186 | 1 |
| 4187 | 1 |
| 4188 | 1 |
| 4189 | 1 |
| 4190 | 1 |
| 4191 | 1 |
| 4192 | 1 |
| 4193 | 1 |
| 4194 | 1 |
| 4195 | 1 |
| 4196 | 1 |
| 4197 | 1 |
| 4198 | 1 |
| 4199 | 1 |
| 4200 | 1 |
| 4201 | 1 |
| 4202 | 1 |
| 4203 | 1 |
| 4204 | 1 |
| 4205 | 1 |
| 4206 | 1 |
| 4207 | 1 |
| 4208 | 1 |
| 4209 | 1 |
| 4210 | 1 |
| 4211 | 1 |
| 4212 | 1 |
| 4213 | 1 |
| 4214 | 1 |
| 4215 | 1 |
| 4216 | 1 |
| 4217 | 1 |
| 4218 | 1 |
| 4219 | 1 |
| 4220 | 1 |
| 4221 | 1 |
| 4222 | 1 |
| 4223 | 1 |
| 4224 | 1 |
| 4225 | 1 |
| 4226 | 1 |
| 4227 | 1 |
| 4228 | 1 |
| 4229 | 1 |
| 4230 | 1 |
| 4231 | 1 |
| 4232 | 1 |
| 4233 | 1 |
| 4234 | 1 |
| 4235 | 1 |
| 4236 | 1 |
| 4237 | 1 |
| 4238 | 1 |
| 4239 | 1 |
| 4240 | 1 |
| 4241 | 1 |
| 4242 | 1 |
| 4243 | 1 |
| 4244 | 1 |
| 4245 | 1 |
| 4246 | 1 |
| 4247 | 1 |
| 4248 | 1 |
| 4249 | 1 |
| 4250 | 1 |
| 4251 | 1 |
| 4252 | 1 |
| 4253 | 1 |
| 4254 | 1 |
| 4255 | 1 |
| 4256 | 1 |
| 4257 | 1 |
| 4258 | 1 |
| 4259 | 1 |
| 4260 | 1 |
| 4261 | 1 |
| 4262 | 1 |
| 4263 | 1 |
| 4264 | 1 |
| 4265 | 1 |
| 4266 | 1 |
| 4267 | 1 |
| 4268 | 1 |
| 4269 | 1 |
| 4270 | 1 |
| 4271 | 1 |
| 4272 | 1 |
| 4273 | 1 |
| 4274 | 1 |
| 4275 | 1 |
| 4276 | 1 |
| 4277 | 1 |
| 4278 | 1 |
| 4279 | 1 |
| 4280 | 1 |
| 4281 | 1 |
| 4282 | 1 |
| 4283 | 1 |
| 4284 | 1 |
| 4285 | 1 |
| 4286 | 1 |
| 4287 | 1 |
| 4288 | 1 |
| 4289 | 1 |
| 4290 | 1 |
| 4291 | 1 |
| 4292 | 1 |
| 4293 | 1 |
| 4294 | 1 |
| 4295 | 1 |
| 4296 | 1 |
| 4297 | 1 |
| 4298 | 1 |
| 4299 | 1 |
| 4300 | 1 |
| 4301 | 1 |
| 4302 | 1 |
| 4303 | 1 |
| 4304 | 1 |
| 4305 | 1 |
| 4306 | 1 |
| 4307 | 1 |
| 4308 | 1 |
| 4309 | 1 |
| 4310 | 1 |
| 4311 | 1 |
| 4312 | 1 |
| 4313 | 1 |
| 4314 | 1 |
| 4315 | 1 |
| 4316 | 1 |
| 4317 | 1 |
| 4318 | 1 |
| 4319 | 1 |
| 4320 | 1 |
| 4321 | 1 |
| 4322 | 1 |
| 4323 | 1 |
| 4324 | 1 |
| 4325 | 1 |
| 4326 | 1 |
| 4327 | 1 |
| 4328 | 1 |
| 4329 | 1 |
| 4330 | 1 |
| 4331 | 1 |
| 4332 | 1 |
| 4333 | 1 |
| 4334 | 1 |
| 4335 | 1 |
| 4336 | 1 |
| 4337 | 1 |
| 4338 | 1 |
| 4339 | 1 |
| 4340 | 1 |
| 4341 | 1 |
| 4342 | 1 |
| 4343 | 1 |
| 4344 | 1 |
| 4345 | 1 |
| 4346 | 1 |
| 4347 | 1 |
| 4348 | 1 |
| 4349 | 1 |
| 4350 | 1 |
| 4351 | 1 |
| 4352 | 1 |
| 4353 | 1 |
| 4354 | 1 |
| 4355 | 1 |
| 4356 | 1 |
| 4357 | 1 |
| 4358 | 1 |
| 4359 | 1 |
| 4360 | 1 |
| 4361 | 1 |
| 4362 | 1 |
| 4363 | 1 |
| 4364 | 1 |
| 4365 | 1 |
| 4366 | 1 |
| 4367 | 1 |
| 4368 | 1 |
| 4369 | 1 |
| 4370 | 1 |
| 4371 | 1 |
| 4372 | 1 |
| 4373 | 1 |
| 4374 | 1 |
| 4375 | 1 |
| 4376 | 1 |
| 4377 | 1 |
| 4378 | 1 |
| 4379 | 1 |
| 4380 | 1 |
| 4381 | 1 |
| 4382 | 1 |
| 4383 | 1 |
| 4384 | 1 |
| 4385 | 1 |
| 4386 | 1 |
| 4387 | 1 |
| 4388 | 1 |
| 4389 | 1 |
| 4390 | 1 |
| 4391 | 1 |
| 4392 | 1 |
| 4393 | 1 |
| 4394 | 1 |
| 4395 | 1 |
| 4396 | 1 |
| 4397 | 1 |
| 4398 | 1 |
| 4399 | 1 |
| 4400 | 1 |
| 4401 | 1 |
| 4402 | 1 |
| 4403 | 1 |
| 4404 | 1 |
| 4405 | 1 |
| 4406 | 1 |
| 4407 | 1 |
| 4408 | 1 |
| 4409 | 1 |
| 4410 | 1 |
| 4411 | 1 |
| 4412 | 1 |
| 4413 | 1 |
| 4414 | 1 |
| 4415 | 1 |
| 4416 | 1 |
| 4417 | 1 |
| 4418 | 1 |
| 4419 | 1 |
| 4420 | 1 |
| 4421 | 1 |
| 4422 | 1 |
| 4423 | 1 |
| 4424 | 1 |
| 4425 | 1 |
| 4426 | 1 |
| 4427 | 1 |
| 4428 | 1 |
| 4429 | 1 |
| 4430 | 1 |
| 4431 | 1 |
| 4432 | 1 |
| 4433 | 1 |
| 4434 | 1 |
| 4435 | 1 |
| 4436 | 1 |
| 4437 | 1 |
| 4438 | 1 |
| 4439 | 1 |
| 4440 | 1 |
| 4441 | 1 |
| 4442 | 1 |
| 4443 | 1 |
| 4444 | 1 |
| 4445 | 1 |
| 4446 | 1 |
| 4447 | 1 |
| 4448 | 1 |
| 4449 | 1 |
| 4450 | 1 |
| 4451 | 1 |
| 4452 | 1 |
| 4453 | 1 |
| 4454 | 1 |
| 4455 | 1 |
| 4456 | 1 |
| 4457 | 1 |
| 4458 | 1 |
| 4459 | 1 |
| 4460 | 1 |
| 4461 | 1 |
| 4462 | 1 |
| 4463 | 1 |
| 4464 | 1 |
| 4465 | 1 |
| 4466 | 1 |
| 4467 | 1 |
| 4468 | 1 |
| 4469 | 1 |
| 4470 | 1 |
| 4471 | 1 |
| 4472 | 1 |
| 4473 | 1 |
| 4474 | 1 |
| 4475 | 1 |
| 4476 | 1 |
| 4477 | 1 |
| 4478 | 1 |
| 4479 | 1 |
| 4480 | 1 |
| 4481 | 1 |
| 4482 | 1 |
| 4483 | 1 |
| 4484 | 1 |
| 4485 | 1 |
| 4486 | 1 |
| 4487 | 1 |
| 4488 | 1 |
| 4489 | 1 |
| 4490 | 1 |
| 4491 | 1 |
| 4492 | 1 |
| 4493 | 1 |
| 4494 | 1 |
| 4495 | 1 |
| 4496 | 1 |
| 4497 | 1 |
| 4498 | 1 |
| 4499 | 1 |
| 4500 | 1 |
| 4501 | 1 |
| 4502 | 1 |
| 4503 | 1 |
| 4504 | 1 |
| 4505 | 1 |
| 4506 | 1 |
| 4507 | 1 |
| 4508 | 1 |
| 4509 | 1 |
| 4510 | 1 |
| 4511 | 1 |
| 4512 | 1 |
| 4513 | 1 |
| 4514 | 1 |
| 4515 | 1 |
| 4516 | 1 |
| 4517 | 1 |
| 4518 | 1 |
| 4519 | 1 |
| 4520 | 1 |
| 4521 | 1 |
| 4522 | 1 |
| 4523 | 1 |
| 4524 | 1 |
| 4525 | 1 |
| 4526 | 1 |
| 4527 | 1 |
| 4528 | 1 |
| 4529 | 1 |
| 4530 | 1 |
| 4531 | 1 |
| 4532 | 1 |
| 4533 | 1 |
| 4534 | 1 |
| 4535 | 1 |
| 4536 | 1 |
| 4537 | 1 |
| 4538 | 1 |
| 4539 | 1 |
| 4540 | 1 |
| 4541 | 1 |
| 4542 | 1 |
| 4543 | 1 |
| 4544 | 1 |
| 4545 | 1 |
| 4546 | 1 |
| 4547 | 1 |
| 4548 | 1 |
| 4549 | 1 |
| 4550 | 1 |
| 4551 | 1 |
| 4552 | 1 |
| 4553 | 1 |
| 4554 | 1 |
| 4555 | 1 |
| 4556 | 1 |
| 4557 | 1 |
| 4558 | 1 |
| 4559 | 1 |
| 4560 | 1 |
| 4561 | 1 |
| 4562 | 1 |
| 4563 | 1 |
| 4564 | 1 |
| 4565 | 1 |
| 4566 | 1 |
| 4567 | 1 |
| 4568 | 1 |
| 4569 | 1 |
| 4570 | 1 |
| 4571 | 1 |
| 4572 | 1 |
| 4573 | 1 |
| 4574 | 1 |
| 4575 | 1 |
| 4576 | 1 |
| 4577 | 1 |
| 4578 | 1 |
| 4579 | 1 |
| 4580 | 1 |
| 4581 | 1 |
| 4582 | 1 |
| 4583 | 1 |
| 4584 | 1 |
| 4585 | 1 |
| 4586 | 1 |
| 4587 | 1 |
| 4588 | 1 |
| 4589 | 1 |
| 4590 | 1 |
| 4591 | 1 |
| 4592 | 1 |
| 4593 | 1 |
| 4594 | 1 |
| 4595 | 1 |
| 4596 | 1 |
| 4597 | 1 |
| 4598 | 1 |
| 4599 | 1 |
| 4600 | 1 |
| 4601 | 1 |
| 4602 | 1 |
| 4603 | 1 |
| 4604 | 1 |
| 4605 | 1 |
| 4606 | 1 |
| 4607 | 1 |
| 4608 | 1 |
| 4609 | 1 |
| 4610 | 1 |
| 4611 | 1 |
| 4612 | 1 |
| 4613 | 1 |
| 4614 | 1 |
| 4615 | 1 |
| 4616 | 1 |
| 4617 | 1 |
| 4618 | 1 |
| 4619 | 1 |
| 4620 | 1 |
| 4621 | 1 |
| 4622 | 1 |
| 4623 | 1 |
| 4624 | 1 |
| 4625 | 1 |
| 4626 | 1 |
| 4627 | 1 |
| 4628 | 1 |
| 4629 | 1 |
| 4630 | 1 |
| 4631 | 1 |
| 4632 | 1 |
| 4633 | 1 |
| 4634 | 1 |
| 4635 | 1 |
| 4636 | 1 |
| 4637 | 1 |
| 4638 | 1 |
| 4639 | 1 |
| 4640 | 1 |
| 4641 | 1 |
| 4642 | 1 |
| 4643 | 1 |
| 4644 | 1 |
| 4645 | 1 |
| 4646 | 1 |
| 4647 | 1 |
| 4648 | 1 |
| 4649 | 1 |
| 4650 | 1 |
| 4651 | 1 |
| 4652 | 1 |
| 4653 | 1 |
| 4654 | 1 |
| 4655 | 1 |
| 4656 | 1 |
| 4657 | 1 |
| 4658 | 1 |
| 4659 | 1 |
| 4660 | 1 |
| 4661 | 1 |
| 4662 | 1 |
| 4663 | 1 |
| 4664 | 1 |
| 4665 | 1 |
| 4666 | 1 |
| 4667 | 1 |
| 4668 | 1 |
| 4669 | 1 |
| 4670 | 1 |
| 4671 | 1 |
| 4672 | 1 |
| 4673 | 1 |
| 4674 | 1 |
| 4675 | 1 |
| 4676 | 1 |
| 4677 | 1 |
| 4678 | 1 |
| 4679 | 1 |
| 4680 | 1 |
| 4681 | 1 |
| 4682 | 1 |
| 4683 | 1 |
| 4684 | 1 |
| 4685 | 1 |
| 4686 | 1 |
| 4687 | 1 |
| 4688 | 1 |
| 4689 | 1 |
| 4690 | 1 |
| 4691 | 1 |
| 4692 | 1 |
| 4693 | 1 |
| 4694 | 1 |
| 4695 | 1 |
| 4696 | 1 |
| 4697 | 1 |
| 4698 | 1 |
| 4699 | 1 |
| 4700 | 1 |
| 4701 | 1 |
| 4702 | 1 |
| 4703 | 1 |
| 4704 | 1 |
| 4705 | 1 |
| 4706 | 1 |
| 4707 | 1 |
| 4708 | 1 |
| 4709 | 1 |
| 4710 | 1 |
| 4711 | 1 |
| 4712 | 1 |
| 4713 | 1 |
| 4714 | 1 |
| 4715 | 1 |
| 4716 | 1 |
| 4717 | 1 |
| 4718 | 1 |
| 4719 | 1 |
| 4720 | 1 |
| 4721 | 1 |
| 4722 | 1 |
| 4723 | 1 |
| 4724 | 1 |
| 4725 | 1 |
| 4726 | 1 |
| 4727 | 1 |
| 4728 | 1 |
| 4729 | 1 |
| 4730 | 1 |
| 4731 | 1 |
| 4732 | 1 |
| 4733 | 1 |
| 4734 | 1 |
| 4735 | 1 |
| 4736 | 1 |
| 4737 | 1 |
| 4738 | 1 |
| 4739 | 1 |
| 4740 | 1 |
| 4741 | 1 |
| 4742 | 1 |
| 4743 | 1 |
| 4744 | 1 |
| 4745 | 1 |
| 4746 | 1 |
| 4747 | 1 |
| 4748 | 1 |
| 4749 | 1 |
| 4750 | 1 |
| 4751 | 1 |
| 4752 | 1 |
| 4753 | 1 |
| 4754 | 1 |
| 4755 | 1 |
| 4756 | 1 |
| 4757 | 1 |
| 4758 | 1 |
| 4759 | 1 |
| 4760 | 1 |
| 4761 | 1 |
| 4762 | 1 |
| 4763 | 1 |
| 4764 | 1 |
| 4765 | 1 |
| 4766 | 1 |
| 4767 | 1 |
| 4768 | 1 |
| 4769 | 1 |
| 4770 | 1 |
| 4771 | 1 |
| 4772 | 1 |
| 4773 | 1 |
| 4774 | 1 |
| 4775 | 1 |
| 4776 | 1 |
| 4777 | 1 |
| 4778 | 1 |
| 4779 | 1 |
| 4780 | 1 |
| 4781 | 1 |
| 4782 | 1 |
| 4783 | 1 |
| 4784 | 1 |
| 4785 | 1 |
| 4786 | 1 |
| 4787 | 1 |
| 4788 | 1 |
| 4789 | 1 |
| 4790 | 1 |
| 4791 | 1 |
| 4792 | 1 |
| 4793 | 1 |
| 4794 | 1 |
| 4795 | 1 |
| 4796 | 1 |
| 4797 | 1 |
| 4798 | 1 |
| 4799 | 1 |
| 4800 | 1 |
| 4801 | 1 |
| 4802 | 1 |
| 4803 | 1 |
| 4804 | 1 |
| 4805 | 1 |
| 4806 | 1 |
| 4807 | 1 |
| 4808 | 1 |
| 4809 | 1 |
| 4810 | 1 |
| 4811 | 1 |
| 4812 | 1 |
| 4813 | 1 |
| 4814 | 1 |
| 4815 | 1 |
| 4816 | 1 |
| 4817 | 1 |
| 4818 | 1 |
| 4819 | 1 |
| 4820 | 1 |
| 4821 | 1 |
| 4822 | 1 |
| 4823 | 1 |
| 4824 | 1 |
| 4825 | 1 |
| 4826 | 1 |
| 4827 | 1 |
| 4828 | 1 |
| 4829 | 1 |
| 4830 | 1 |
| 4831 | 1 |
| 4832 | 1 |
| 4833 | 1 |
| 4834 | 1 |
| 4835 | 1 |
| 4836 | 1 |
| 4837 | 1 |
| 4838 | 1 |
| 4839 | 1 |
| 4840 | 1 |
| 4841 | 1 |
| 4842 | 1 |
| 4843 | 1 |
| 4844 | 1 |
| 4845 | 1 |
| 4846 | 1 |
| 4847 | 1 |
| 4848 | 1 |
| 4849 | 1 |
| 4850 | 1 |
| 4851 | 1 |
| 4852 | 1 |
| 4853 | 1 |
| 4854 | 1 |
| 4855 | 1 |
| 4856 | 1 |
| 4857 | 1 |
| 4858 | 1 |
| 4859 | 1 |
| 4860 | 1 |
| 4861 | 1 |
| 4862 | 1 |
| 4863 | 1 |
| 4864 | 1 |
| 4865 | 1 |
| 4866 | 1 |
| 4867 | 1 |
| 4868 | 1 |
| 4869 | 1 |
| 4870 | 1 |
| 4871 | 1 |
| 4872 | 1 |
| 4873 | 1 |
| 4874 | 1 |
| 4875 | 1 |
| 4876 | 1 |
| 4877 | 1 |
| 4878 | 1 |
| 4879 | 1 |
| 4880 | 1 |
| 4881 | 1 |
| 4882 | 1 |
| 4883 | 1 |
| 4884 | 1 |
| 4885 | 1 |
| 4886 | 1 |
| 4887 | 1 |
| 4888 | 1 |
| 4889 | 1 |
| 4890 | 1 |
| 4891 | 1 |
| 4892 | 1 |
| 4893 | 1 |
| 4894 | 1 |
| 4895 | 1 |
| 4896 | 1 |
| 4897 | 1 |
| 4898 | 1 |
| 4899 | 1 |
| 4900 | 1 |
| 4901 | 1 |
| 4902 | 1 |
| 4903 | 1 |
| 4904 | 1 |
| 4905 | 1 |
| 4906 | 1 |
| 4907 | 1 |
| 4908 | 1 |
| 4909 | 1 |
| 4910 | 1 |
| 4911 | 1 |
| 4912 | 1 |
| 4913 | 1 |
| 4914 | 1 |
| 4915 | 1 |
| 4916 | 1 |
| 4917 | 1 |
| 4918 | 1 |
| 4919 | 1 |
| 4920 | 1 |
| 4921 | 1 |
| 4922 | 1 |
| 4923 | 1 |
| 4924 | 1 |
| 4925 | 1 |
| 4926 | 1 |
| 4927 | 1 |
| 4928 | 1 |
| 4929 | 1 |
| 4930 | 1 |
| 4931 | 1 |
| 4932 | 1 |
| 4933 | 1 |
| 4934 | 1 |
| 4935 | 1 |
| 4936 | 1 |
| 4937 | 1 |
| 4938 | 1 |
| 4939 | 1 |
| 4940 | 1 |
| 4941 | 1 |
| 4942 | 1 |
| 4943 | 1 |
| 4944 | 1 |
| 4945 | 1 |
| 4946 | 1 |
| 4947 | 1 |
| 4948 | 1 |
| 4949 | 1 |
| 4950 | 1 |
| 4951 | 1 |
| 4952 | 1 |
| 4953 | 1 |
| 4954 | 1 |
| 4955 | 1 |
| 4956 | 1 |
| 4957 | 1 |
| 4958 | 1 |
| 4959 | 1 |
| 4960 | 1 |
| 4961 | 1 |
| 4962 | 1 |
| 4963 | 1 |
| 4964 | 1 |
| 4965 | 1 |
| 4966 | 1 |
| 4967 | 1 |
| 4968 | 1 |
| 4969 | 1 |
| 4970 | 1 |
| 4971 | 1 |
| 4972 | 1 |
| 4973 | 1 |
| 4974 | 1 |
| 4975 | 1 |
| 4976 | 1 |
| 4977 | 1 |
| 4978 | 1 |
| 4979 | 1 |
| 4980 | 1 |
| 4981 | 1 |
| 4982 | 1 |
| 4983 | 1 |
| 4984 | 1 |
| 4985 | 1 |
| 4986 | 1 |
| 4987 | 1 |
| 4988 | 1 |
| 4989 | 1 |
| 4990 | 1 |
| 4991 | 1 |
| 4992 | 1 |
| 4993 | 1 |
| 4994 | 1 |
| 4995 | 1 |
| 4996 | 1 |
| 4997 | 1 |
| 4998 | 1 |
| 4999 | 1 |
| 5000 | 1 |
| 5001 | 1 |
| 5002 | 1 |
| 5003 | 1 |
| 5004 | 1 |
| 5005 | 1 |
| 5006 | 1 |
| 5007 | 1 |
| 5008 | 1 |
| 5009 | 1 |
| 5010 | 1 |
| 5011 | 1 |
| 5012 | 1 |
| 5013 | 1 |
| 5014 | 1 |
| 5015 | 1 |
| 5016 | 1 |
| 5017 | 1 |
| 5018 | 1 |
| 5019 | 1 |
| 5020 | 1 |
| 5021 | 1 |
| 5022 | 1 |
| 5023 | 1 |
| 5024 | 1 |
| 5025 | 1 |
| 5026 | 1 |
| 5027 | 1 |
| 5028 | 1 |
| 5029 | 1 |
| 5030 | 1 |
| 5031 | 1 |
| 5032 | 1 |
| 5033 | 1 |
| 5034 | 1 |
| 5035 | 1 |
| 5036 | 1 |
| 5037 | 1 |
| 5038 | 1 |
| 5039 | 1 |
| 5040 | 1 |
| 5041 | 1 |
| 5042 | 1 |
| 5043 | 1 |
| 5044 | 1 |
| 5045 | 1 |
| 5046 | 1 |
| 5047 | 1 |
| 5048 | 1 |
| 5049 | 1 |
| 5050 | 1 |
| 5051 | 1 |
| 5052 | 1 |
| 5053 | 1 |
| 5054 | 1 |
| 5055 | 1 |
| 5056 | 1 |
| 5057 | 1 |
| 5058 | 1 |
| 5059 | 1 |
| 5060 | 1 |
| 5061 | 1 |
| 5062 | 1 |
| 5063 | 1 |
| 5064 | 1 |
| 5065 | 1 |
| 5066 | 1 |
| 5067 | 1 |
| 5068 | 1 |
| 5069 | 1 |
| 5070 | 1 |
| 5071 | 1 |
| 5072 | 1 |
| 5073 | 1 |
| 5074 | 1 |
| 5075 | 1 |
| 5076 | 1 |
| 5077 | 1 |
| 5078 | 1 |
| 5079 | 1 |
| 5080 | 1 |
| 5081 | 1 |
| 5082 | 1 |
| 5083 | 1 |
| 5084 | 1 |
| 5085 | 1 |
| 5086 | 1 |
| 5087 | 1 |
| 5088 | 1 |
| 5089 | 1 |
| 5090 | 1 |
| 5091 | 1 |
| 5092 | 1 |
| 5093 | 1 |
| 5094 | 1 |
| 5095 | 1 |
| 5096 | 1 |
| 5097 | 1 |
| 5098 | 1 |
| 5099 | 1 |
| 5100 | 1 |
| 5101 | 1 |
| 5102 | 1 |
| 5103 | 1 |
| 5104 | 1 |
| 5105 | 1 |
| 5106 | 1 |
| 5107 | 1 |
| 5108 | 1 |
| 5109 | 1 |
| 5110 | 1 |
| 5111 | 1 |
| 5112 | 1 |
| 5113 | 1 |
| 5114 | 1 |
| 5115 | 1 |
| 5116 | 1 |
| 5117 | 1 |
| 5118 | 1 |
| 5119 | 1 |
| 5120 | 1 |
| 5121 | 1 |
| 5122 | 1 |
| 5123 | 1 |
| 5124 | 1 |
| 5125 | 1 |
| 5126 | 1 |
| 5127 | 1 |
| 5128 | 1 |
| 5129 | 1 |
| 5130 | 1 |
| 5131 | 1 |
| 5132 | 1 |
| 5133 | 1 |
| 5134 | 1 |
| 5135 | 1 |
| 5136 | 1 |
| 5137 | 1 |
| 5138 | 1 |
| 5139 | 1 |
| 5140 | 1 |
| 5141 | 1 |
| 5142 | 1 |
| 5143 | 1 |
| 5144 | 1 |
| 5145 | 1 |
| 5146 | 1 |
| 5147 | 1 |
| 5148 | 1 |
| 5149 | 1 |
| 5150 | 1 |
| 5151 | 1 |
| 5152 | 1 |
| 5153 | 1 |
| 5154 | 1 |
| 5155 | 1 |
| 5156 | 1 |
| 5157 | 1 |
| 5158 | 1 |
| 5159 | 1 |
| 5160 | 1 |
| 5161 | 1 |
| 5162 | 1 |
| 5163 | 1 |
| 5164 | 1 |
| 5165 | 1 |
| 5166 | 1 |
| 5167 | 1 |
| 5168 | 1 |
| 5169 | 1 |
| 5170 | 1 |
| 5171 | 1 |
| 5172 | 1 |
| 5173 | 1 |
| 5174 | 1 |
| 5175 | 1 |
| 5176 | 1 |
| 5177 | 1 |
| 5178 | 1 |
| 5179 | 1 |
| 5180 | 1 |
| 5181 | 1 |
| 5182 | 1 |
| 5183 | 1 |
| 5184 | 1 |
| 5185 | 1 |
| 5186 | 1 |
| 5187 | 1 |
| 5188 | 1 |
| 5189 | 1 |
| 5190 | 1 |
| 5191 | 1 |
| 5192 | 1 |
| 5193 | 1 |
| 5194 | 1 |
| 5195 | 1 |
| 5196 | 1 |
| 5197 | 1 |
| 5198 | 1 |
| 5199 | 1 |
| 5200 | 1 |
| 5201 | 1 |
| 5202 | 1 |
| 5203 | 1 |
| 5204 | 1 |
| 5205 | 1 |
| 5206 | 1 |
| 5207 | 1 |
| 5208 | 1 |
| 5209 | 1 |
| 5210 | 1 |
| 5211 | 1 |
| 5212 | 1 |
| 5213 | 1 |
| 5214 | 1 |
| 5215 | 1 |
| 5216 | 1 |
| 5217 | 1 |
| 5218 | 1 |
| 5219 | 1 |
| 5220 | 1 |
| 5221 | 1 |
| 5222 | 1 |
| 5223 | 1 |
| 5224 | 1 |
| 5225 | 1 |
| 5226 | 1 |
| 5227 | 1 |
| 5228 | 1 |
| 5229 | 1 |
| 5230 | 1 |
| 5231 | 1 |
| 5232 | 1 |
| 5233 | 1 |
| 5234 | 1 |
| 5235 | 1 |
| 5236 | 1 |
| 5237 | 1 |
| 5238 | 1 |
| 5239 | 1 |
| 5240 | 1 |
| 5241 | 1 |
| 5242 | 1 |
| 5243 | 1 |
| 5244 | 1 |
| 5245 | 1 |
| 5246 | 1 |
| 5247 | 1 |
| 5248 | 1 |
| 5249 | 1 |
| 5250 | 1 |
| 5251 | 1 |
| 5252 | 1 |
| 5253 | 1 |
| 5254 | 1 |
| 5255 | 1 |
| 5256 | 1 |
| 5257 | 1 |
| 5258 | 1 |
| 5259 | 1 |
| 5260 | 1 |
| 5261 | 1 |
| 5262 | 1 |
| 5263 | 1 |
| 5264 | 1 |
| 5265 | 1 |
| 5266 | 1 |
| 5267 | 1 |
| 5268 | 1 |
| 5269 | 1 |
| 5270 | 1 |
| 5271 | 1 |
| 5272 | 1 |
| 5273 | 1 |
| 5274 | 1 |
| 5275 | 1 |
| 5276 | 1 |
| 5277 | 1 |
| 5278 | 1 |
| 5279 | 1 |
| 5280 | 1 |
| 5281 | 1 |
| 5282 | 1 |
| 5283 | 1 |
| 5284 | 1 |
| 5285 | 1 |
| 5286 | 1 |
| 5287 | 1 |
| 5288 | 1 |
| 5289 | 1 |
| 5290 | 1 |
| 5291 | 1 |
| 5292 | 1 |
| 5293 | 1 |
| 5294 | 1 |
| 5295 | 1 |
| 5296 | 1 |
| 5297 | 1 |
| 5298 | 1 |
| 5299 | 1 |
| 5300 | 1 |
| 5301 | 1 |
| 5302 | 1 |
| 5303 | 1 |
| 5304 | 1 |
| 5305 | 1 |
| 5306 | 1 |
| 5307 | 1 |
| 5308 | 1 |
| 5309 | 1 |
| 5310 | 1 |
| 5311 | 1 |
| 5312 | 1 |
| 5313 | 1 |
| 5314 | 1 |
| 5315 | 1 |
| 5316 | 1 |
| 5317 | 1 |
| 5318 | 1 |
| 5319 | 1 |
| 5320 | 1 |
| 5321 | 1 |
| 5322 | 1 |
| 5323 | 1 |
| 5324 | 1 |
| 5325 | 1 |
| 5326 | 1 |
| 5327 | 1 |
| 5328 | 1 |
| 5329 | 1 |
| 5330 | 1 |
| 5331 | 1 |
| 5332 | 1 |
| 5333 | 1 |
| 5334 | 1 |
| 5335 | 1 |
| 5336 | 1 |
| 5337 | 1 |
| 5338 | 1 |
| 5339 | 1 |
| 5340 | 1 |
| 5341 | 1 |
| 5342 | 1 |
| 5343 | 1 |
| 5344 | 1 |
| 5345 | 1 |
| 5346 | 1 |
| 5347 | 1 |
| 5348 | 1 |
| 5349 | 1 |
| 5350 | 1 |
| 5351 | 1 |
| 5352 | 1 |
| 5353 | 1 |
| 5354 | 1 |
| 5355 | 1 |
| 5356 | 1 |
| 5357 | 1 |
| 5358 | 1 |
| 5359 | 1 |
| 5360 | 1 |
| 5361 | 1 |
| 5362 | 1 |
| 5363 | 1 |
| 5364 | 1 |
| 5365 | 1 |
| 5366 | 1 |
| 5367 | 1 |
| 5368 | 1 |
| 5369 | 1 |
| 5370 | 1 |
| 5371 | 1 |
| 5372 | 1 |
| 5373 | 1 |
| 5374 | 1 |
| 5375 | 1 |
| 5376 | 1 |
| 5377 | 1 |
| 5378 | 1 |
| 5379 | 1 |
| 5380 | 1 |
| 5381 | 1 |
| 5382 | 1 |
| 5383 | 1 |
| 5384 | 1 |
| 5385 | 1 |
| 5386 | 1 |
| 5387 | 1 |
| 5388 | 1 |
| 5389 | 1 |
| 5390 | 1 |
| 5391 | 1 |
| 5392 | 1 |
| 5393 | 1 |
| 5394 | 1 |
| 5395 | 1 |
| 5396 | 1 |
| 5397 | 1 |
| 5398 | 1 |
| 5399 | 1 |
| 5400 | 1 |
| 5401 | 1 |
| 5402 | 1 |
| 5403 | 1 |
| 5404 | 1 |
| 5405 | 1 |
| 5406 | 1 |
| 5407 | 1 |
| 5408 | 1 |
| 5409 | 1 |
| 5410 | 1 |
| 5411 | 1 |
| 5412 | 1 |
| 5413 | 1 |
| 5414 | 1 |
| 5415 | 1 |
| 5416 | 1 |
| 5417 | 1 |
| 5418 | 1 |
| 5419 | 1 |
| 5420 | 1 |
| 5421 | 1 |
| 5422 | 1 |
| 5423 | 1 |
| 5424 | 1 |
| 5425 | 1 |
| 5426 | 1 |
| 5427 | 1 |
| 5428 | 1 |
| 5429 | 1 |
| 5430 | 1 |
| 5431 | 1 |
| 5432 | 1 |
| 5433 | 1 |
| 5434 | 1 |
| 5435 | 1 |
| 5436 | 1 |
| 5437 | 1 |
| 5438 | 1 |
| 5439 | 1 |
| 5440 | 1 |
| 5441 | 1 |
| 5442 | 1 |
| 5443 | 1 |
| 5444 | 1 |
| 5445 | 1 |
| 5446 | 1 |
| 5447 | 1 |
| 5448 | 1 |
| 5449 | 1 |
| 5450 | 1 |
| 5451 | 1 |
| 5452 | 1 |
| 5453 | 1 |
| 5454 | 1 |
| 5455 | 1 |
| 5456 | 1 |
| 5457 | 1 |
| 5458 | 1 |
| 5459 | 1 |
| 5460 | 1 |
| 5461 | 1 |
| 5462 | 1 |
| 5463 | 1 |
| 5464 | 1 |
| 5465 | 1 |
| 5466 | 1 |
| 5467 | 1 |
| 5468 | 1 |
| 5469 | 1 |
| 5470 | 1 |
| 5471 | 1 |
| 5472 | 1 |
| 5473 | 1 |
| 5474 | 1 |
| 5475 | 1 |
| 5476 | 1 |
| 5477 | 1 |
| 5478 | 1 |
| 5479 | 1 |
| 5480 | 1 |
| 5481 | 1 |
| 5482 | 1 |
| 5483 | 1 |
| 5484 | 1 |
| 5485 | 1 |
| 5486 | 1 |
| 5487 | 1 |
| 5488 | 1 |
| 5489 | 1 |
| 5490 | 1 |
| 5491 | 1 |
| 5492 | 1 |
| 5493 | 1 |
| 5494 | 1 |
| 5495 | 1 |
| 5496 | 1 |
| 5497 | 1 |
| 5498 | 1 |
| 5499 | 1 |
| 5500 | 1 |
| 5501 | 1 |
| 5502 | 1 |
| 5503 | 1 |
| 5504 | 1 |
| 5505 | 1 |
| 5506 | 1 |
| 5507 | 1 |
| 5508 | 1 |
| 5509 | 1 |
| 5510 | 1 |
| 5511 | 1 |
| 5512 | 1 |
| 5513 | 1 |
| 5514 | 1 |
| 5515 | 1 |
| 5516 | 1 |
| 5517 | 1 |
| 5518 | 1 |
| 5519 | 1 |
| 5520 | 1 |
| 5521 | 1 |
| 5522 | 1 |
| 5523 | 1 |
| 5524 | 1 |
| 5525 | 1 |
| 5526 | 1 |
| 5527 | 1 |
| 5528 | 1 |
| 5529 | 1 |
| 5530 | 1 |
| 5531 | 1 |
| 5532 | 1 |
| 5533 | 1 |
| 5534 | 1 |
| 5535 | 1 |
| 5536 | 1 |
| 5537 | 1 |
| 5538 | 1 |
| 5539 | 1 |
| 5540 | 1 |
| 5541 | 1 |
| 5542 | 1 |
| 5543 | 1 |
| 5544 | 1 |
| 5545 | 1 |
| 5546 | 1 |
| 5547 | 1 |
| 5548 | 1 |
| 5549 | 1 |
| 5550 | 1 |
| 5551 | 1 |
| 5552 | 1 |
| 5553 | 1 |
| 5554 | 1 |
| 5555 | 1 |
| 5556 | 1 |
| 5557 | 1 |
| 5558 | 1 |
| 5559 | 1 |
| 5560 | 1 |
| 5561 | 1 |
| 5562 | 1 |
| 5563 | 1 |
| 5564 | 1 |
| 5565 | 1 |
| 5566 | 1 |
| 5567 | 1 |
| 5568 | 1 |
| 5569 | 1 |
| 5570 | 1 |
| 5571 | 1 |
| 5572 | 1 |
| 5573 | 1 |
| 5574 | 1 |
| 5575 | 1 |
| 5576 | 1 |
| 5577 | 1 |
| 5578 | 1 |
| 5579 | 1 |
| 5580 | 1 |
| 5581 | 1 |
| 5582 | 1 |
| 5583 | 1 |
| 5584 | 1 |
| 5585 | 1 |
| 5586 | 1 |
| 5587 | 1 |
| 5588 | 1 |
| 5589 | 1 |
| 5590 | 1 |
| 5591 | 1 |
| 5592 | 1 |
| 5593 | 1 |
| 5594 | 1 |
| 5595 | 1 |
| 5596 | 1 |
| 5597 | 1 |
| 5598 | 1 |
| 5599 | 1 |
| 5600 | 1 |
| 5601 | 1 |
| 5602 | 1 |
| 5603 | 1 |
| 5604 | 1 |
| 5605 | 1 |
| 5606 | 1 |
| 5607 | 1 |
| 5608 | 1 |
| 5609 | 1 |
| 5610 | 1 |
| 5611 | 1 |
| 5612 | 1 |
| 5613 | 1 |
| 5614 | 1 |
| 5615 | 1 |
| 5616 | 1 |
| 5617 | 1 |
| 5618 | 1 |
| 5619 | 1 |
| 5620 | 1 |
| 5621 | 1 |
| 5622 | 1 |
| 5623 | 1 |
| 5624 | 1 |
| 5625 | 1 |
| 5626 | 1 |
| 5627 | 1 |
| 5628 | 1 |
| 5629 | 1 |
| 5630 | 1 |
| 5631 | 1 |
| 5632 | 1 |
| 5633 | 1 |
| 5634 | 1 |
| 5635 | 1 |
| 5636 | 1 |
| 5637 | 1 |
| 5638 | 1 |
| 5639 | 1 |
| 5640 | 1 |
| 5641 | 1 |
| 5642 | 1 |
| 5643 | 1 |
| 5644 | 1 |
| 5645 | 1 |
| 5646 | 1 |
| 5647 | 1 |
| 5648 | 1 |
| 5649 | 1 |
| 5650 | 1 |
| 5651 | 1 |
| 5652 | 1 |
| 5653 | 1 |
| 5654 | 1 |
| 5655 | 1 |
| 5656 | 1 |
| 5657 | 1 |
| 5658 | 1 |
| 5659 | 1 |
| 5660 | 1 |
| 5661 | 1 |
| 5662 | 1 |
| 5663 | 1 |
| 5664 | 1 |
| 5665 | 1 |
| 5666 | 1 |
| 5667 | 1 |
| 5668 | 1 |
| 5669 | 1 |
| 5670 | 1 |
| 5671 | 1 |
| 5672 | 1 |
| 5673 | 1 |
| 5674 | 1 |
| 5675 | 1 |
| 5676 | 1 |
| 5677 | 1 |
| 5678 | 1 |
| 5679 | 1 |
| 5680 | 1 |
| 5681 | 1 |
| 5682 | 1 |
| 5683 | 1 |
| 5684 | 1 |
| 5685 | 1 |
| 5686 | 1 |
| 5687 | 1 |
| 5688 | 1 |
| 5689 | 1 |
| 5690 | 1 |
| 5691 | 1 |
| 5692 | 1 |
| 5693 | 1 |
| 5694 | 1 |
| 5695 | 1 |
| 5696 | 1 |
| 5697 | 1 |
| 5698 | 1 |
| 5699 | 1 |
| 5700 | 1 |
| 5701 | 1 |
| 5702 | 1 |
| 5703 | 1 |
| 5704 | 1 |
| 5705 | 1 |
| 5706 | 1 |
| 5707 | 1 |
| 5708 | 1 |
| 5709 | 1 |
| 5710 | 1 |
| 5711 | 1 |
| 5712 | 1 |
| 5713 | 1 |
| 5714 | 1 |
| 5715 | 1 |
| 5716 | 1 |
| 5717 | 1 |
| 5718 | 1 |
| 5719 | 1 |
| 5720 | 1 |
| 5721 | 1 |
| 5722 | 1 |
| 5723 | 1 |
| 5724 | 1 |
| 5725 | 1 |
| 5726 | 1 |
| 5727 | 1 |
| 5728 | 1 |
| 5729 | 1 |
| 5730 | 1 |
| 5731 | 1 |
| 5732 | 1 |
| 5733 | 1 |
| 5734 | 1 |
| 5735 | 1 |
| 5736 | 1 |
| 5737 | 1 |
| 5738 | 1 |
| 5739 | 1 |
| 5740 | 1 |
| 5741 | 1 |
| 5742 | 1 |
| 5743 | 1 |
| 5744 | 1 |
| 5745 | 1 |
| 5746 | 1 |
| 5747 | 1 |
| 5748 | 1 |
| 5749 | 1 |
| 5750 | 1 |
| 5751 | 1 |
| 5752 | 1 |
| 5753 | 1 |
| 5754 | 1 |
| 5755 | 1 |
| 5756 | 1 |
| 5757 | 1 |
| 5758 | 1 |
| 5759 | 1 |
| 5760 | 1 |
| 5761 | 1 |
| 5762 | 1 |
| 5763 | 1 |
| 5764 | 1 |
| 5765 | 1 |
| 5766 | 1 |
| 5767 | 1 |
| 5768 | 1 |
| 5769 | 1 |
| 5770 | 1 |
| 5771 | 1 |
| 5772 | 1 |
| 5773 | 1 |
| 5774 | 1 |
| 5775 | 1 |
| 5776 | 1 |
| 5777 | 1 |
| 5778 | 1 |
| 5779 | 1 |
| 5780 | 1 |
| 5781 | 1 |
| 5782 | 1 |
| 5783 | 1 |
| 5784 | 1 |
| 5785 | 1 |
| 5786 | 1 |
| 5787 | 1 |
| 5788 | 1 |
| 5789 | 1 |
| 5790 | 1 |
| 5791 | 1 |
| 5792 | 1 |
| 5793 | 1 |
| 5794 | 1 |
| 5795 | 1 |
| 5796 | 1 |
| 5797 | 1 |
| 5798 | 1 |
| 5799 | 1 |
| 5800 | 1 |
| 5801 | 1 |
| 5802 | 1 |
| 5803 | 1 |
| 5804 | 1 |
| 5805 | 1 |
| 5806 | 1 |
| 5807 | 1 |
| 5808 | 1 |
| 5809 | 1 |
| 5810 | 1 |
| 5811 | 1 |
| 5812 | 1 |
| 5813 | 1 |
| 5814 | 1 |
| 5815 | 1 |
| 5816 | 1 |
| 5817 | 1 |
| 5818 | 1 |
| 5819 | 1 |
| 5820 | 1 |
| 5821 | 1 |
| 5822 | 1 |
| 5823 | 1 |
| 5824 | 1 |
| 5825 | 1 |
| 5826 | 1 |
| 5827 | 1 |
| 5828 | 1 |
| 5829 | 1 |
| 5830 | 1 |
| 5831 | 1 |
| 5832 | 1 |
| 5833 | 1 |
| 5834 | 1 |
| 5835 | 1 |
| 5836 | 1 |
| 5837 | 1 |
| 5838 | 1 |
| 5839 | 1 |
| 5840 | 1 |
| 5841 | 1 |
| 5842 | 1 |
| 5843 | 1 |
| 5844 | 1 |
| 5845 | 1 |
| 5846 | 1 |
| 5847 | 1 |
| 5848 | 1 |
| 5849 | 1 |
| 5850 | 1 |
| 5851 | 1 |
| 5852 | 1 |
| 5853 | 1 |
| 5854 | 1 |
| 5855 | 1 |
| 5856 | 1 |
| 5857 | 1 |
| 5858 | 1 |
| 5859 | 1 |
| 5860 | 1 |
| 5861 | 1 |
| 5862 | 1 |
| 5863 | 1 |
| 5864 | 1 |
| 5865 | 1 |
| 5866 | 1 |
| 5867 | 1 |
| 5868 | 1 |
| 5869 | 1 |
| 5870 | 1 |
| 5871 | 1 |
| 5872 | 1 |
| 5873 | 1 |
| 5874 | 1 |
| 5875 | 1 |
| 5876 | 1 |
| 5877 | 1 |
| 5878 | 1 |
| 5879 | 1 |
| 5880 | 1 |
| 5881 | 1 |
| 5882 | 1 |
| 5883 | 1 |
| 5884 | 1 |
| 5885 | 1 |
| 5886 | 1 |
| 5887 | 1 |
| 5888 | 1 |
| 5889 | 1 |
| 5890 | 1 |
| 5891 | 1 |
| 5892 | 1 |
| 5893 | 1 |
| 5894 | 1 |
| 5895 | 1 |
| 5896 | 1 |
| 5897 | 1 |
| 5898 | 1 |
| 5899 | 1 |
| 5900 | 1 |
| 5901 | 1 |
| 5902 | 1 |
| 5903 | 1 |
| 5904 | 1 |
| 5905 | 1 |
| 5906 | 1 |
| 5907 | 1 |
| 5908 | 1 |
| 5909 | 1 |
| 5910 | 1 |
| 5911 | 1 |
| 5912 | 1 |
| 5913 | 1 |
| 5914 | 1 |
| 5915 | 1 |
| 5916 | 1 |
| 5917 | 1 |
| 5918 | 1 |
| 5919 | 1 |
| 5920 | 1 |
| 5921 | 1 |
| 5922 | 1 |
| 5923 | 1 |
| 5924 | 1 |
| 5925 | 1 |
| 5926 | 1 |
| 5927 | 1 |
| 5928 | 1 |
| 5929 | 1 |
| 5930 | 1 |
| 5931 | 1 |
| 5932 | 1 |
| 5933 | 1 |
| 5934 | 1 |
| 5935 | 1 |
| 5936 | 1 |
| 5937 | 1 |
| 5938 | 1 |
| 5939 | 1 |
| 5940 | 1 |
| 5941 | 1 |
| 5942 | 1 |
| 5943 | 1 |
| 5944 | 1 |
| 5945 | 1 |
| 5946 | 1 |
| 5947 | 1 |
| 5948 | 1 |
| 5949 | 1 |
| 5950 | 1 |
| 5951 | 1 |
| 5952 | 1 |
| 5953 | 1 |
| 5954 | 1 |
| 5955 | 1 |
| 5956 | 1 |
| 5957 | 1 |
| 5958 | 1 |
| 5959 | 1 |
| 5960 | 1 |
| 5961 | 1 |
| 5962 | 1 |
| 5963 | 1 |
| 5964 | 1 |
| 5965 | 1 |
| 5966 | 1 |
| 5967 | 1 |
| 5968 | 1 |
| 5969 | 1 |
| 5970 | 1 |
| 5971 | 1 |
| 5972 | 1 |
| 5973 | 1 |
| 5974 | 1 |
| 5975 | 1 |
| 5976 | 1 |
| 5977 | 1 |
| 5978 | 1 |
| 5979 | 1 |
| 5980 | 1 |
| 5981 | 1 |
| 5982 | 1 |
| 5983 | 1 |
| 5984 | 1 |
| 5985 | 1 |
| 5986 | 1 |
| 5987 | 1 |
| 5988 | 1 |
| 5989 | 1 |
| 5990 | 1 |
| 5991 | 1 |
| 5992 | 1 |
| 5993 | 1 |
| 5994 | 1 |
| 5995 | 1 |
| 5996 | 1 |
| 5997 | 1 |
| 5998 | 1 |
| 5999 | 1 |
| 6000 | 1 |
| 6001 | 1 |
| 6002 | 1 |
| 6003 | 1 |
| 6004 | 1 |
| 6005 | 1 |
| 6006 | 1 |
| 6007 | 1 |
| 6008 | 1 |
| 6009 | 1 |
| 6010 | 1 |
| 6011 | 1 |
| 6012 | 1 |
| 6013 | 1 |
| 6014 | 1 |
| 6015 | 1 |
| 6016 | 1 |
| 6017 | 1 |
| 6018 | 1 |
| 6019 | 1 |
| 6020 | 1 |
| 6021 | 1 |
| 6022 | 1 |
| 6023 | 1 |
| 6024 | 1 |
| 6025 | 1 |
| 6026 | 1 |
| 6027 | 1 |
| 6028 | 1 |
| 6029 | 1 |
| 6030 | 1 |
| 6031 | 1 |
| 6032 | 1 |
| 6033 | 1 |
| 6034 | 1 |
| 6035 | 1 |
| 6036 | 1 |
| 6037 | 1 |
| 6038 | 1 |
| 6039 | 1 |
| 6040 | 1 |
| 6041 | 1 |
| 6042 | 1 |
| 6043 | 1 |
| 6044 | 1 |
| 6045 | 1 |
| 6046 | 1 |
| 6047 | 1 |
| 6048 | 1 |
| 6049 | 1 |
| 6050 | 1 |
| 6051 | 1 |
| 6052 | 1 |
| 6053 | 1 |
| 6054 | 1 |
| 6055 | 1 |
| 6056 | 1 |
| 6057 | 1 |
| 6058 | 1 |
| 6059 | 1 |
| 6060 | 1 |
| 6061 | 1 |
| 6062 | 1 |
| 6063 | 1 |
| 6064 | 1 |
| 6065 | 1 |
| 6066 | 1 |
| 6067 | 1 |
| 6068 | 1 |
| 6069 | 1 |
| 6070 | 1 |
| 6071 | 1 |
| 6072 | 1 |
| 6073 | 1 |
| 6074 | 1 |
| 6075 | 1 |
| 6076 | 1 |
| 6077 | 1 |
| 6078 | 1 |
| 6079 | 1 |
| 6080 | 1 |
| 6081 | 1 |
| 6082 | 1 |
| 6083 | 1 |
| 6084 | 1 |
| 6085 | 1 |
| 6086 | 1 |
| 6087 | 1 |
| 6088 | 1 |
| 6089 | 1 |
| 6090 | 1 |
| 6091 | 1 |
| 6092 | 1 |
| 6093 | 1 |
| 6094 | 1 |
| 6095 | 1 |
| 6096 | 1 |
| 6097 | 1 |
| 6098 | 1 |
| 6099 | 1 |
| 6100 | 1 |
| 6101 | 1 |
| 6102 | 1 |
| 6103 | 1 |
| 6104 | 1 |
| 6105 | 1 |
| 6106 | 1 |
| 6107 | 1 |
| 6108 | 1 |
| 6109 | 1 |
| 6110 | 1 |
| 6111 | 1 |
| 6112 | 1 |
| 6113 | 1 |
| 6114 | 1 |
| 6115 | 1 |
| 6116 | 1 |
| 6117 | 1 |
| 6118 | 1 |
| 6119 | 1 |
| 6120 | 1 |
| 6121 | 1 |
| 6122 | 1 |
| 6123 | 1 |
| 6124 | 1 |
| 6125 | 1 |
| 6126 | 1 |
| 6127 | 1 |
| 6128 | 1 |
| 6129 | 1 |
| 6130 | 1 |
| 6131 | 1 |
| 6132 | 1 |
| 6133 | 1 |
| 6134 | 1 |
| 6135 | 1 |
| 6136 | 1 |
| 6137 | 1 |
| 6138 | 1 |
| 6139 | 1 |
| 6140 | 1 |
| 6141 | 1 |
| 6142 | 1 |
| 6143 | 1 |
| 6144 | 1 |
| 6145 | 1 |
| 6146 | 1 |
| 6147 | 1 |
| 6148 | 1 |
| 6149 | 1 |
| 6150 | 1 |
| 6151 | 1 |
| 6152 | 1 |
| 6153 | 1 |
| 6154 | 1 |
| 6155 | 1 |
| 6156 | 1 |
| 6157 | 1 |
| 6158 | 1 |
| 6159 | 1 |
| 6160 | 1 |
| 6161 | 1 |
| 6162 | 1 |
| 6163 | 1 |
| 6164 | 1 |
| 6165 | 1 |
| 6166 | 1 |
| 6167 | 1 |
| 6168 | 1 |
| 6169 | 1 |
| 6170 | 1 |
| 6171 | 1 |
| 6172 | 1 |
| 6173 | 1 |
| 6174 | 1 |
| 6175 | 1 |
| 6176 | 1 |
| 6177 | 1 |
| 6178 | 1 |
| 6179 | 1 |
| 6180 | 1 |
| 6181 | 1 |
| 6182 | 1 |
| 6183 | 1 |
| 6184 | 1 |
| 6185 | 1 |
| 6186 | 1 |
| 6187 | 1 |
| 6188 | 1 |
| 6189 | 1 |
| 6190 | 1 |
| 6191 | 1 |
| 6192 | 1 |
| 6193 | 1 |
| 6194 | 1 |
| 6195 | 1 |
| 6196 | 1 |
| 6197 | 1 |
| 6198 | 1 |
| 6199 | 1 |
| 6200 | 1 |
| 6201 | 1 |
| 6202 | 1 |
| 6203 | 1 |
| 6204 | 1 |
| 6205 | 1 |
| 6206 | 1 |
| 6207 | 1 |
| 6208 | 1 |
| 6209 | 1 |
| 6210 | 1 |
| 6211 | 1 |
| 6212 | 1 |
| 6213 | 1 |
| 6214 | 1 |
| 6215 | 1 |
| 6216 | 1 |
| 6217 | 1 |
| 6218 | 1 |
| 6219 | 1 |
| 6220 | 1 |
| 6221 | 1 |
| 6222 | 1 |
| 6223 | 1 |
| 6224 | 1 |
| 6225 | 1 |
| 6226 | 1 |
| 6227 | 1 |
| 6228 | 1 |
| 6229 | 1 |
| 6230 | 1 |
| 6231 | 1 |
| 6232 | 1 |
| 6233 | 1 |
| 6234 | 1 |
| 6235 | 1 |
| 6236 | 1 |
| 6237 | 1 |
| 6238 | 1 |
| 6239 | 1 |
| 6240 | 1 |
| 6241 | 1 |
| 6242 | 1 |
| 6243 | 1 |
| 6244 | 1 |
| 6245 | 1 |
| 6246 | 1 |
| 6247 | 1 |
| 6248 | 1 |
| 6249 | 1 |
| 6250 | 1 |
| 6251 | 1 |
| 6252 | 1 |
| 6253 | 1 |
| 6254 | 1 |
| 6255 | 1 |
| 6256 | 1 |
| 6257 | 1 |
| 6258 | 1 |
| 6259 | 1 |
| 6260 | 1 |
| 6261 | 1 |
| 6262 | 1 |
| 6263 | 1 |
| 6264 | 1 |
| 6265 | 1 |
| 6266 | 1 |
| 6267 | 1 |
| 6268 | 1 |
| 6269 | 1 |
| 6270 | 1 |
| 6271 | 1 |
| 6272 | 1 |
| 6273 | 1 |
| 6274 | 1 |
| 6275 | 1 |
| 6276 | 1 |
| 6277 | 1 |
| 6278 | 1 |
| 6279 | 1 |
| 6280 | 1 |
| 6281 | 1 |
| 6282 | 1 |
| 6283 | 1 |
| 6284 | 1 |
| 6285 | 1 |
| 6286 | 1 |
| 6287 | 1 |
| 6288 | 1 |
| 6289 | 1 |
| 6290 | 1 |
| 6291 | 1 |
| 6292 | 1 |
| 6293 | 1 |
| 6294 | 1 |
| 6295 | 1 |
| 6296 | 1 |
| 6297 | 1 |
| 6298 | 1 |
| 6299 | 1 |
| 6300 | 1 |
| 6301 | 1 |
| 6302 | 1 |
| 6303 | 1 |
| 6304 | 1 |
| 6305 | 1 |
| 6306 | 1 |
| 6307 | 1 |
| 6308 | 1 |
| 6309 | 1 |
| 6310 | 1 |
| 6311 | 1 |
| 6312 | 1 |
| 6313 | 1 |
| 6314 | 1 |
| 6315 | 1 |
| 6316 | 1 |
| 6317 | 1 |
| 6318 | 1 |
| 6319 | 1 |
| 6320 | 1 |
| 6321 | 1 |
| 6322 | 1 |
| 6323 | 1 |
| 6324 | 1 |
| 6325 | 1 |
| 6326 | 1 |
| 6327 | 1 |
| 6328 | 1 |
| 6329 | 1 |
| 6330 | 1 |
| 6331 | 1 |
| 6332 | 1 |
| 6333 | 1 |
| 6334 | 1 |
| 6335 | 1 |
| 6336 | 1 |
| 6337 | 1 |
| 6338 | 1 |
| 6339 | 1 |
| 6340 | 1 |
| 6341 | 1 |
| 6342 | 1 |
| 6343 | 1 |
| 6344 | 1 |
| 6345 | 1 |
| 6346 | 1 |
| 6347 | 1 |
| 6348 | 1 |
| 6349 | 1 |
| 6350 | 1 |
| 6351 | 1 |
| 6352 | 1 |
| 6353 | 1 |
| 6354 | 1 |
| 6355 | 1 |
| 6356 | 1 |
| 6357 | 1 |
| 6358 | 1 |
| 6359 | 1 |
| 6360 | 1 |
| 6361 | 1 |
| 6362 | 1 |
| 6363 | 1 |
| 6364 | 1 |
| 6365 | 1 |
| 6366 | 1 |
| 6367 | 1 |
| 6368 | 1 |
| 6369 | 1 |
| 6370 | 1 |
| 6371 | 1 |
| 6372 | 1 |
| 6373 | 1 |
| 6374 | 1 |